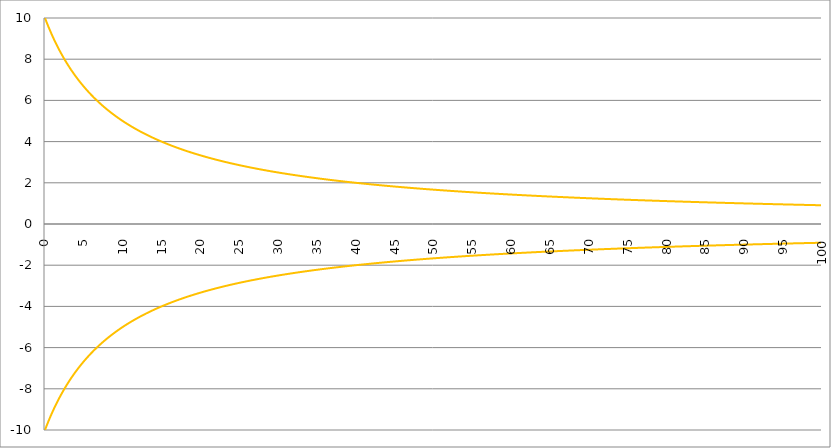
| Category | Series 1 | Series 0 | Series 2 |
|---|---|---|---|
| 0.0 | 10 | -10 |  |
| 0.05 | 9.95 | -9.95 |  |
| 0.1 | 9.901 | -9.901 |  |
| 0.15 | 9.852 | -9.852 |  |
| 0.2 | 9.804 | -9.804 |  |
| 0.25 | 9.756 | -9.756 |  |
| 0.3 | 9.709 | -9.709 |  |
| 0.35 | 9.662 | -9.662 |  |
| 0.4 | 9.615 | -9.615 |  |
| 0.45 | 9.569 | -9.569 |  |
| 0.5 | 9.524 | -9.524 |  |
| 0.55 | 9.479 | -9.479 |  |
| 0.6 | 9.434 | -9.434 |  |
| 0.65 | 9.39 | -9.39 |  |
| 0.7 | 9.346 | -9.346 |  |
| 0.75 | 9.302 | -9.302 |  |
| 0.8 | 9.259 | -9.259 |  |
| 0.85 | 9.217 | -9.217 |  |
| 0.9 | 9.174 | -9.174 |  |
| 0.95 | 9.132 | -9.132 |  |
| 1.0 | 9.091 | -9.091 |  |
| 1.05 | 9.05 | -9.05 |  |
| 1.1 | 9.009 | -9.009 |  |
| 1.15 | 8.969 | -8.969 |  |
| 1.2 | 8.929 | -8.929 |  |
| 1.25 | 8.889 | -8.889 |  |
| 1.3 | 8.85 | -8.85 |  |
| 1.35 | 8.811 | -8.811 |  |
| 1.400000000000001 | 8.772 | -8.772 |  |
| 1.450000000000001 | 8.734 | -8.734 |  |
| 1.500000000000001 | 8.696 | -8.696 |  |
| 1.550000000000001 | 8.658 | -8.658 |  |
| 1.600000000000001 | 8.621 | -8.621 |  |
| 1.650000000000001 | 8.584 | -8.584 |  |
| 1.700000000000001 | 8.547 | -8.547 |  |
| 1.750000000000001 | 8.511 | -8.511 |  |
| 1.800000000000001 | 8.475 | -8.475 |  |
| 1.850000000000001 | 8.439 | -8.439 |  |
| 1.900000000000001 | 8.403 | -8.403 |  |
| 1.950000000000001 | 8.368 | -8.368 |  |
| 2.000000000000001 | 8.333 | -8.333 |  |
| 2.050000000000001 | 8.299 | -8.299 |  |
| 2.100000000000001 | 8.264 | -8.264 |  |
| 2.15 | 8.23 | -8.23 |  |
| 2.2 | 8.197 | -8.197 |  |
| 2.25 | 8.163 | -8.163 |  |
| 2.3 | 8.13 | -8.13 |  |
| 2.35 | 8.097 | -8.097 |  |
| 2.399999999999999 | 8.065 | -8.065 |  |
| 2.449999999999999 | 8.032 | -8.032 |  |
| 2.499999999999999 | 8 | -8 |  |
| 2.549999999999999 | 7.968 | -7.968 |  |
| 2.599999999999999 | 7.937 | -7.937 |  |
| 2.649999999999998 | 7.905 | -7.905 |  |
| 2.699999999999998 | 7.874 | -7.874 |  |
| 2.749999999999998 | 7.843 | -7.843 |  |
| 2.799999999999998 | 7.813 | -7.813 |  |
| 2.849999999999998 | 7.782 | -7.782 |  |
| 2.899999999999998 | 7.752 | -7.752 |  |
| 2.949999999999997 | 7.722 | -7.722 |  |
| 2.999999999999997 | 7.692 | -7.692 |  |
| 3.049999999999997 | 7.663 | -7.663 |  |
| 3.099999999999997 | 7.634 | -7.634 |  |
| 3.149999999999997 | 7.605 | -7.605 |  |
| 3.199999999999997 | 7.576 | -7.576 |  |
| 3.249999999999996 | 7.547 | -7.547 |  |
| 3.299999999999996 | 7.519 | -7.519 |  |
| 3.349999999999996 | 7.491 | -7.491 |  |
| 3.399999999999996 | 7.463 | -7.463 |  |
| 3.449999999999996 | 7.435 | -7.435 |  |
| 3.499999999999996 | 7.407 | -7.407 |  |
| 3.549999999999995 | 7.38 | -7.38 |  |
| 3.599999999999995 | 7.353 | -7.353 |  |
| 3.649999999999995 | 7.326 | -7.326 |  |
| 3.699999999999995 | 7.299 | -7.299 |  |
| 3.749999999999995 | 7.273 | -7.273 |  |
| 3.799999999999994 | 7.246 | -7.246 |  |
| 3.849999999999994 | 7.22 | -7.22 |  |
| 3.899999999999994 | 7.194 | -7.194 |  |
| 3.949999999999994 | 7.168 | -7.168 |  |
| 3.999999999999994 | 7.143 | -7.143 |  |
| 4.049999999999994 | 7.117 | -7.117 |  |
| 4.099999999999993 | 7.092 | -7.092 |  |
| 4.149999999999993 | 7.067 | -7.067 |  |
| 4.199999999999993 | 7.042 | -7.042 |  |
| 4.249999999999993 | 7.018 | -7.018 |  |
| 4.299999999999993 | 6.993 | -6.993 |  |
| 4.349999999999992 | 6.969 | -6.969 |  |
| 4.399999999999992 | 6.944 | -6.944 |  |
| 4.449999999999992 | 6.92 | -6.92 |  |
| 4.499999999999992 | 6.897 | -6.897 |  |
| 4.549999999999992 | 6.873 | -6.873 |  |
| 4.599999999999992 | 6.849 | -6.849 |  |
| 4.649999999999991 | 6.826 | -6.826 |  |
| 4.699999999999991 | 6.803 | -6.803 |  |
| 4.749999999999991 | 6.78 | -6.78 |  |
| 4.799999999999991 | 6.757 | -6.757 |  |
| 4.849999999999991 | 6.734 | -6.734 |  |
| 4.899999999999991 | 6.711 | -6.711 |  |
| 4.94999999999999 | 6.689 | -6.689 |  |
| 4.99999999999999 | 6.667 | -6.667 |  |
| 5.04999999999999 | 6.645 | -6.645 |  |
| 5.09999999999999 | 6.623 | -6.623 |  |
| 5.14999999999999 | 6.601 | -6.601 |  |
| 5.199999999999989 | 6.579 | -6.579 |  |
| 5.24999999999999 | 6.557 | -6.557 |  |
| 5.29999999999999 | 6.536 | -6.536 |  |
| 5.349999999999989 | 6.515 | -6.515 |  |
| 5.399999999999989 | 6.494 | -6.494 |  |
| 5.449999999999988 | 6.472 | -6.472 |  |
| 5.499999999999988 | 6.452 | -6.452 |  |
| 5.549999999999988 | 6.431 | -6.431 |  |
| 5.599999999999988 | 6.41 | -6.41 |  |
| 5.649999999999988 | 6.39 | -6.39 |  |
| 5.699999999999988 | 6.369 | -6.369 |  |
| 5.749999999999987 | 6.349 | -6.349 |  |
| 5.799999999999987 | 6.329 | -6.329 |  |
| 5.849999999999987 | 6.309 | -6.309 |  |
| 5.899999999999987 | 6.289 | -6.289 |  |
| 5.949999999999986 | 6.27 | -6.27 |  |
| 5.999999999999986 | 6.25 | -6.25 |  |
| 6.049999999999986 | 6.231 | -6.231 |  |
| 6.099999999999986 | 6.211 | -6.211 |  |
| 6.149999999999986 | 6.192 | -6.192 |  |
| 6.199999999999986 | 6.173 | -6.173 |  |
| 6.249999999999985 | 6.154 | -6.154 |  |
| 6.299999999999985 | 6.135 | -6.135 |  |
| 6.349999999999985 | 6.116 | -6.116 |  |
| 6.399999999999985 | 6.098 | -6.098 |  |
| 6.449999999999985 | 6.079 | -6.079 |  |
| 6.499999999999984 | 6.061 | -6.061 |  |
| 6.549999999999984 | 6.042 | -6.042 |  |
| 6.599999999999984 | 6.024 | -6.024 |  |
| 6.649999999999984 | 6.006 | -6.006 |  |
| 6.699999999999984 | 5.988 | -5.988 |  |
| 6.749999999999984 | 5.97 | -5.97 |  |
| 6.799999999999984 | 5.952 | -5.952 |  |
| 6.849999999999984 | 5.935 | -5.935 |  |
| 6.899999999999983 | 5.917 | -5.917 |  |
| 6.949999999999983 | 5.9 | -5.9 |  |
| 6.999999999999983 | 5.882 | -5.882 |  |
| 7.049999999999983 | 5.865 | -5.865 |  |
| 7.099999999999983 | 5.848 | -5.848 |  |
| 7.149999999999983 | 5.831 | -5.831 |  |
| 7.199999999999982 | 5.814 | -5.814 |  |
| 7.249999999999982 | 5.797 | -5.797 |  |
| 7.299999999999982 | 5.78 | -5.78 |  |
| 7.349999999999982 | 5.764 | -5.764 |  |
| 7.399999999999982 | 5.747 | -5.747 |  |
| 7.449999999999981 | 5.731 | -5.731 |  |
| 7.499999999999981 | 5.714 | -5.714 |  |
| 7.549999999999981 | 5.698 | -5.698 |  |
| 7.599999999999981 | 5.682 | -5.682 |  |
| 7.649999999999981 | 5.666 | -5.666 |  |
| 7.699999999999981 | 5.65 | -5.65 |  |
| 7.74999999999998 | 5.634 | -5.634 |  |
| 7.79999999999998 | 5.618 | -5.618 |  |
| 7.84999999999998 | 5.602 | -5.602 |  |
| 7.89999999999998 | 5.587 | -5.587 |  |
| 7.94999999999998 | 5.571 | -5.571 |  |
| 7.99999999999998 | 5.556 | -5.556 |  |
| 8.04999999999998 | 5.54 | -5.54 |  |
| 8.09999999999998 | 5.525 | -5.525 |  |
| 8.14999999999998 | 5.51 | -5.51 |  |
| 8.19999999999998 | 5.495 | -5.495 |  |
| 8.249999999999982 | 5.479 | -5.479 |  |
| 8.299999999999981 | 5.464 | -5.464 |  |
| 8.349999999999984 | 5.45 | -5.45 |  |
| 8.399999999999984 | 5.435 | -5.435 |  |
| 8.449999999999985 | 5.42 | -5.42 |  |
| 8.499999999999986 | 5.405 | -5.405 |  |
| 8.549999999999986 | 5.391 | -5.391 |  |
| 8.599999999999987 | 5.376 | -5.376 |  |
| 8.649999999999986 | 5.362 | -5.362 |  |
| 8.699999999999989 | 5.348 | -5.348 |  |
| 8.74999999999999 | 5.333 | -5.333 |  |
| 8.79999999999999 | 5.319 | -5.319 |  |
| 8.84999999999999 | 5.305 | -5.305 |  |
| 8.89999999999999 | 5.291 | -5.291 |  |
| 8.94999999999999 | 5.277 | -5.277 |  |
| 8.99999999999999 | 5.263 | -5.263 |  |
| 9.049999999999994 | 5.249 | -5.249 |  |
| 9.099999999999994 | 5.236 | -5.236 |  |
| 9.149999999999995 | 5.222 | -5.222 |  |
| 9.199999999999996 | 5.208 | -5.208 |  |
| 9.249999999999996 | 5.195 | -5.195 |  |
| 9.299999999999997 | 5.181 | -5.181 |  |
| 9.349999999999998 | 5.168 | -5.168 |  |
| 9.399999999999999 | 5.155 | -5.155 |  |
| 9.45 | 5.141 | -5.141 |  |
| 9.5 | 5.128 | -5.128 |  |
| 9.55 | 5.115 | -5.115 |  |
| 9.600000000000001 | 5.102 | -5.102 |  |
| 9.650000000000002 | 5.089 | -5.089 |  |
| 9.700000000000003 | 5.076 | -5.076 |  |
| 9.750000000000004 | 5.063 | -5.063 |  |
| 9.800000000000004 | 5.051 | -5.051 |  |
| 9.850000000000003 | 5.038 | -5.038 |  |
| 9.900000000000006 | 5.025 | -5.025 |  |
| 9.950000000000006 | 5.013 | -5.013 |  |
| 10.00000000000001 | 5 | -5 |  |
| 10.05000000000001 | 4.988 | -4.988 |  |
| 10.10000000000001 | 4.975 | -4.975 |  |
| 10.15000000000001 | 4.963 | -4.963 |  |
| 10.20000000000001 | 4.95 | -4.95 |  |
| 10.25000000000001 | 4.938 | -4.938 |  |
| 10.30000000000001 | 4.926 | -4.926 |  |
| 10.35000000000001 | 4.914 | -4.914 |  |
| 10.40000000000001 | 4.902 | -4.902 |  |
| 10.45000000000001 | 4.89 | -4.89 |  |
| 10.50000000000001 | 4.878 | -4.878 |  |
| 10.55000000000001 | 4.866 | -4.866 |  |
| 10.60000000000002 | 4.854 | -4.854 |  |
| 10.65000000000002 | 4.843 | -4.843 |  |
| 10.70000000000002 | 4.831 | -4.831 |  |
| 10.75000000000002 | 4.819 | -4.819 |  |
| 10.80000000000002 | 4.808 | -4.808 |  |
| 10.85000000000002 | 4.796 | -4.796 |  |
| 10.90000000000002 | 4.785 | -4.785 |  |
| 10.95000000000002 | 4.773 | -4.773 |  |
| 11.00000000000002 | 4.762 | -4.762 |  |
| 11.05000000000002 | 4.751 | -4.751 |  |
| 11.10000000000002 | 4.739 | -4.739 |  |
| 11.15000000000002 | 4.728 | -4.728 |  |
| 11.20000000000002 | 4.717 | -4.717 |  |
| 11.25000000000002 | 4.706 | -4.706 |  |
| 11.30000000000003 | 4.695 | -4.695 |  |
| 11.35000000000003 | 4.684 | -4.684 |  |
| 11.40000000000003 | 4.673 | -4.673 |  |
| 11.45000000000003 | 4.662 | -4.662 |  |
| 11.50000000000003 | 4.651 | -4.651 |  |
| 11.55000000000003 | 4.64 | -4.64 |  |
| 11.60000000000003 | 4.63 | -4.63 |  |
| 11.65000000000003 | 4.619 | -4.619 |  |
| 11.70000000000003 | 4.608 | -4.608 |  |
| 11.75000000000003 | 4.598 | -4.598 |  |
| 11.80000000000003 | 4.587 | -4.587 |  |
| 11.85000000000003 | 4.577 | -4.577 |  |
| 11.90000000000003 | 4.566 | -4.566 |  |
| 11.95000000000003 | 4.556 | -4.556 |  |
| 12.00000000000004 | 4.545 | -4.545 |  |
| 12.05000000000004 | 4.535 | -4.535 |  |
| 12.10000000000004 | 4.525 | -4.525 |  |
| 12.15000000000004 | 4.515 | -4.515 |  |
| 12.20000000000004 | 4.505 | -4.505 |  |
| 12.25000000000004 | 4.494 | -4.494 |  |
| 12.30000000000004 | 4.484 | -4.484 |  |
| 12.35000000000004 | 4.474 | -4.474 |  |
| 12.40000000000004 | 4.464 | -4.464 |  |
| 12.45000000000004 | 4.454 | -4.454 |  |
| 12.50000000000004 | 4.444 | -4.444 |  |
| 12.55000000000004 | 4.435 | -4.435 |  |
| 12.60000000000004 | 4.425 | -4.425 |  |
| 12.65000000000004 | 4.415 | -4.415 |  |
| 12.70000000000005 | 4.405 | -4.405 |  |
| 12.75000000000005 | 4.396 | -4.396 |  |
| 12.80000000000005 | 4.386 | -4.386 |  |
| 12.85000000000005 | 4.376 | -4.376 |  |
| 12.90000000000005 | 4.367 | -4.367 |  |
| 12.95000000000005 | 4.357 | -4.357 |  |
| 13.00000000000005 | 4.348 | -4.348 |  |
| 13.05000000000005 | 4.338 | -4.338 |  |
| 13.10000000000005 | 4.329 | -4.329 |  |
| 13.15000000000005 | 4.32 | -4.32 |  |
| 13.20000000000005 | 4.31 | -4.31 |  |
| 13.25000000000005 | 4.301 | -4.301 |  |
| 13.30000000000005 | 4.292 | -4.292 |  |
| 13.35000000000005 | 4.283 | -4.283 |  |
| 13.40000000000006 | 4.274 | -4.274 |  |
| 13.45000000000006 | 4.264 | -4.264 |  |
| 13.50000000000006 | 4.255 | -4.255 |  |
| 13.55000000000006 | 4.246 | -4.246 |  |
| 13.60000000000006 | 4.237 | -4.237 |  |
| 13.65000000000006 | 4.228 | -4.228 |  |
| 13.70000000000006 | 4.219 | -4.219 |  |
| 13.75000000000006 | 4.211 | -4.211 |  |
| 13.80000000000006 | 4.202 | -4.202 |  |
| 13.85000000000006 | 4.193 | -4.193 |  |
| 13.90000000000006 | 4.184 | -4.184 |  |
| 13.95000000000006 | 4.175 | -4.175 |  |
| 14.00000000000006 | 4.167 | -4.167 |  |
| 14.05000000000006 | 4.158 | -4.158 |  |
| 14.10000000000007 | 4.149 | -4.149 |  |
| 14.15000000000007 | 4.141 | -4.141 |  |
| 14.20000000000007 | 4.132 | -4.132 |  |
| 14.25000000000007 | 4.124 | -4.124 |  |
| 14.30000000000007 | 4.115 | -4.115 |  |
| 14.35000000000007 | 4.107 | -4.107 |  |
| 14.40000000000007 | 4.098 | -4.098 |  |
| 14.45000000000007 | 4.09 | -4.09 |  |
| 14.50000000000007 | 4.082 | -4.082 |  |
| 14.55000000000007 | 4.073 | -4.073 |  |
| 14.60000000000007 | 4.065 | -4.065 |  |
| 14.65000000000007 | 4.057 | -4.057 |  |
| 14.70000000000007 | 4.049 | -4.049 |  |
| 14.75000000000007 | 4.04 | -4.04 |  |
| 14.80000000000008 | 4.032 | -4.032 |  |
| 14.85000000000008 | 4.024 | -4.024 |  |
| 14.90000000000008 | 4.016 | -4.016 |  |
| 14.95000000000008 | 4.008 | -4.008 |  |
| 15.00000000000008 | 4 | -4 |  |
| 15.05000000000008 | 3.992 | -3.992 |  |
| 15.10000000000008 | 3.984 | -3.984 |  |
| 15.15000000000008 | 3.976 | -3.976 |  |
| 15.20000000000008 | 3.968 | -3.968 |  |
| 15.25000000000008 | 3.96 | -3.96 |  |
| 15.30000000000008 | 3.953 | -3.953 |  |
| 15.35000000000008 | 3.945 | -3.945 |  |
| 15.40000000000008 | 3.937 | -3.937 |  |
| 15.45000000000008 | 3.929 | -3.929 |  |
| 15.50000000000009 | 3.922 | -3.922 |  |
| 15.55000000000009 | 3.914 | -3.914 |  |
| 15.60000000000009 | 3.906 | -3.906 |  |
| 15.65000000000009 | 3.899 | -3.899 |  |
| 15.70000000000009 | 3.891 | -3.891 |  |
| 15.75000000000009 | 3.883 | -3.883 |  |
| 15.80000000000009 | 3.876 | -3.876 |  |
| 15.8500000000001 | 3.868 | -3.868 |  |
| 15.9000000000001 | 3.861 | -3.861 |  |
| 15.9500000000001 | 3.854 | -3.854 |  |
| 16.00000000000009 | 3.846 | -3.846 |  |
| 16.05000000000009 | 3.839 | -3.839 |  |
| 16.10000000000009 | 3.831 | -3.831 |  |
| 16.15000000000009 | 3.824 | -3.824 |  |
| 16.2000000000001 | 3.817 | -3.817 |  |
| 16.2500000000001 | 3.81 | -3.81 |  |
| 16.3000000000001 | 3.802 | -3.802 |  |
| 16.3500000000001 | 3.795 | -3.795 |  |
| 16.4000000000001 | 3.788 | -3.788 |  |
| 16.4500000000001 | 3.781 | -3.781 |  |
| 16.5000000000001 | 3.774 | -3.774 |  |
| 16.5500000000001 | 3.766 | -3.766 |  |
| 16.6000000000001 | 3.759 | -3.759 |  |
| 16.6500000000001 | 3.752 | -3.752 |  |
| 16.7000000000001 | 3.745 | -3.745 |  |
| 16.7500000000001 | 3.738 | -3.738 |  |
| 16.8000000000001 | 3.731 | -3.731 |  |
| 16.8500000000001 | 3.724 | -3.724 |  |
| 16.90000000000011 | 3.717 | -3.717 |  |
| 16.95000000000011 | 3.711 | -3.711 |  |
| 17.00000000000011 | 3.704 | -3.704 |  |
| 17.05000000000011 | 3.697 | -3.697 |  |
| 17.10000000000011 | 3.69 | -3.69 |  |
| 17.15000000000011 | 3.683 | -3.683 |  |
| 17.20000000000011 | 3.676 | -3.676 |  |
| 17.25000000000011 | 3.67 | -3.67 |  |
| 17.30000000000011 | 3.663 | -3.663 |  |
| 17.35000000000011 | 3.656 | -3.656 |  |
| 17.40000000000011 | 3.65 | -3.65 |  |
| 17.45000000000011 | 3.643 | -3.643 |  |
| 17.50000000000011 | 3.636 | -3.636 |  |
| 17.55000000000011 | 3.63 | -3.63 |  |
| 17.60000000000012 | 3.623 | -3.623 |  |
| 17.65000000000012 | 3.617 | -3.617 |  |
| 17.70000000000012 | 3.61 | -3.61 |  |
| 17.75000000000012 | 3.604 | -3.604 |  |
| 17.80000000000012 | 3.597 | -3.597 |  |
| 17.85000000000012 | 3.591 | -3.591 |  |
| 17.90000000000012 | 3.584 | -3.584 |  |
| 17.95000000000012 | 3.578 | -3.578 |  |
| 18.00000000000012 | 3.571 | -3.571 |  |
| 18.05000000000012 | 3.565 | -3.565 |  |
| 18.10000000000012 | 3.559 | -3.559 |  |
| 18.15000000000012 | 3.552 | -3.552 |  |
| 18.20000000000012 | 3.546 | -3.546 |  |
| 18.25000000000012 | 3.54 | -3.54 |  |
| 18.30000000000013 | 3.534 | -3.534 |  |
| 18.35000000000013 | 3.527 | -3.527 |  |
| 18.40000000000013 | 3.521 | -3.521 |  |
| 18.45000000000013 | 3.515 | -3.515 |  |
| 18.50000000000013 | 3.509 | -3.509 |  |
| 18.55000000000013 | 3.503 | -3.503 |  |
| 18.60000000000013 | 3.497 | -3.497 |  |
| 18.65000000000013 | 3.49 | -3.49 |  |
| 18.70000000000013 | 3.484 | -3.484 |  |
| 18.75000000000013 | 3.478 | -3.478 |  |
| 18.80000000000013 | 3.472 | -3.472 |  |
| 18.85000000000013 | 3.466 | -3.466 |  |
| 18.90000000000013 | 3.46 | -3.46 |  |
| 18.95000000000013 | 3.454 | -3.454 |  |
| 19.00000000000014 | 3.448 | -3.448 |  |
| 19.05000000000014 | 3.442 | -3.442 |  |
| 19.10000000000014 | 3.436 | -3.436 |  |
| 19.15000000000014 | 3.431 | -3.431 |  |
| 19.20000000000014 | 3.425 | -3.425 |  |
| 19.25000000000014 | 3.419 | -3.419 |  |
| 19.30000000000014 | 3.413 | -3.413 |  |
| 19.35000000000014 | 3.407 | -3.407 |  |
| 19.40000000000014 | 3.401 | -3.401 |  |
| 19.45000000000014 | 3.396 | -3.396 |  |
| 19.50000000000014 | 3.39 | -3.39 |  |
| 19.55000000000014 | 3.384 | -3.384 |  |
| 19.60000000000014 | 3.378 | -3.378 |  |
| 19.65000000000014 | 3.373 | -3.373 |  |
| 19.70000000000014 | 3.367 | -3.367 |  |
| 19.75000000000015 | 3.361 | -3.361 |  |
| 19.80000000000015 | 3.356 | -3.356 |  |
| 19.85000000000015 | 3.35 | -3.35 |  |
| 19.90000000000015 | 3.344 | -3.344 |  |
| 19.95000000000015 | 3.339 | -3.339 |  |
| 20.00000000000015 | 3.333 | -3.333 |  |
| 20.05000000000015 | 3.328 | -3.328 |  |
| 20.10000000000015 | 3.322 | -3.322 |  |
| 20.15000000000015 | 3.317 | -3.317 |  |
| 20.20000000000015 | 3.311 | -3.311 |  |
| 20.25000000000015 | 3.306 | -3.306 |  |
| 20.30000000000015 | 3.3 | -3.3 |  |
| 20.35000000000015 | 3.295 | -3.295 |  |
| 20.40000000000015 | 3.289 | -3.289 |  |
| 20.45000000000016 | 3.284 | -3.284 |  |
| 20.50000000000016 | 3.279 | -3.279 |  |
| 20.55000000000016 | 3.273 | -3.273 |  |
| 20.60000000000016 | 3.268 | -3.268 |  |
| 20.65000000000016 | 3.263 | -3.263 |  |
| 20.70000000000016 | 3.257 | -3.257 |  |
| 20.75000000000016 | 3.252 | -3.252 |  |
| 20.80000000000016 | 3.247 | -3.247 |  |
| 20.85000000000016 | 3.241 | -3.241 |  |
| 20.90000000000016 | 3.236 | -3.236 |  |
| 20.95000000000016 | 3.231 | -3.231 |  |
| 21.00000000000016 | 3.226 | -3.226 |  |
| 21.05000000000016 | 3.221 | -3.221 |  |
| 21.10000000000016 | 3.215 | -3.215 |  |
| 21.15000000000017 | 3.21 | -3.21 |  |
| 21.20000000000017 | 3.205 | -3.205 |  |
| 21.25000000000017 | 3.2 | -3.2 |  |
| 21.30000000000017 | 3.195 | -3.195 |  |
| 21.35000000000017 | 3.19 | -3.19 |  |
| 21.40000000000017 | 3.185 | -3.185 |  |
| 21.45000000000017 | 3.18 | -3.18 |  |
| 21.50000000000017 | 3.175 | -3.175 |  |
| 21.55000000000017 | 3.17 | -3.17 |  |
| 21.60000000000017 | 3.165 | -3.165 |  |
| 21.65000000000017 | 3.16 | -3.16 |  |
| 21.70000000000017 | 3.155 | -3.155 |  |
| 21.75000000000017 | 3.15 | -3.15 |  |
| 21.80000000000017 | 3.145 | -3.145 |  |
| 21.85000000000018 | 3.14 | -3.14 |  |
| 21.90000000000018 | 3.135 | -3.135 |  |
| 21.95000000000018 | 3.13 | -3.13 |  |
| 22.00000000000018 | 3.125 | -3.125 |  |
| 22.05000000000018 | 3.12 | -3.12 |  |
| 22.10000000000018 | 3.115 | -3.115 |  |
| 22.15000000000018 | 3.11 | -3.11 |  |
| 22.20000000000018 | 3.106 | -3.106 |  |
| 22.25000000000018 | 3.101 | -3.101 |  |
| 22.30000000000018 | 3.096 | -3.096 |  |
| 22.35000000000018 | 3.091 | -3.091 |  |
| 22.40000000000018 | 3.086 | -3.086 |  |
| 22.45000000000018 | 3.082 | -3.082 |  |
| 22.50000000000018 | 3.077 | -3.077 |  |
| 22.55000000000019 | 3.072 | -3.072 |  |
| 22.60000000000019 | 3.067 | -3.067 |  |
| 22.65000000000019 | 3.063 | -3.063 |  |
| 22.70000000000019 | 3.058 | -3.058 |  |
| 22.75000000000019 | 3.053 | -3.053 |  |
| 22.80000000000019 | 3.049 | -3.049 |  |
| 22.85000000000019 | 3.044 | -3.044 |  |
| 22.90000000000019 | 3.04 | -3.04 |  |
| 22.95000000000019 | 3.035 | -3.035 |  |
| 23.00000000000019 | 3.03 | -3.03 |  |
| 23.05000000000019 | 3.026 | -3.026 |  |
| 23.10000000000019 | 3.021 | -3.021 |  |
| 23.15000000000019 | 3.017 | -3.017 |  |
| 23.20000000000019 | 3.012 | -3.012 |  |
| 23.2500000000002 | 3.008 | -3.008 |  |
| 23.3000000000002 | 3.003 | -3.003 |  |
| 23.3500000000002 | 2.999 | -2.999 |  |
| 23.4000000000002 | 2.994 | -2.994 |  |
| 23.4500000000002 | 2.99 | -2.99 |  |
| 23.5000000000002 | 2.985 | -2.985 |  |
| 23.5500000000002 | 2.981 | -2.981 |  |
| 23.6000000000002 | 2.976 | -2.976 |  |
| 23.6500000000002 | 2.972 | -2.972 |  |
| 23.7000000000002 | 2.967 | -2.967 |  |
| 23.7500000000002 | 2.963 | -2.963 |  |
| 23.8000000000002 | 2.959 | -2.959 |  |
| 23.8500000000002 | 2.954 | -2.954 |  |
| 23.9000000000002 | 2.95 | -2.95 |  |
| 23.95000000000021 | 2.946 | -2.946 |  |
| 24.00000000000021 | 2.941 | -2.941 |  |
| 24.05000000000021 | 2.937 | -2.937 |  |
| 24.10000000000021 | 2.933 | -2.933 |  |
| 24.15000000000021 | 2.928 | -2.928 |  |
| 24.20000000000021 | 2.924 | -2.924 |  |
| 24.25000000000021 | 2.92 | -2.92 |  |
| 24.30000000000021 | 2.915 | -2.915 |  |
| 24.35000000000021 | 2.911 | -2.911 |  |
| 24.40000000000021 | 2.907 | -2.907 |  |
| 24.45000000000021 | 2.903 | -2.903 |  |
| 24.50000000000021 | 2.899 | -2.899 |  |
| 24.55000000000021 | 2.894 | -2.894 |  |
| 24.60000000000021 | 2.89 | -2.89 |  |
| 24.65000000000022 | 2.886 | -2.886 |  |
| 24.70000000000022 | 2.882 | -2.882 |  |
| 24.75000000000022 | 2.878 | -2.878 |  |
| 24.80000000000022 | 2.874 | -2.874 |  |
| 24.85000000000022 | 2.869 | -2.869 |  |
| 24.90000000000022 | 2.865 | -2.865 |  |
| 24.95000000000022 | 2.861 | -2.861 |  |
| 25.00000000000022 | 2.857 | -2.857 |  |
| 25.05000000000022 | 2.853 | -2.853 |  |
| 25.10000000000022 | 2.849 | -2.849 |  |
| 25.15000000000022 | 2.845 | -2.845 |  |
| 25.20000000000022 | 2.841 | -2.841 |  |
| 25.25000000000022 | 2.837 | -2.837 |  |
| 25.30000000000022 | 2.833 | -2.833 |  |
| 25.35000000000023 | 2.829 | -2.829 |  |
| 25.40000000000023 | 2.825 | -2.825 |  |
| 25.45000000000023 | 2.821 | -2.821 |  |
| 25.50000000000023 | 2.817 | -2.817 |  |
| 25.55000000000023 | 2.813 | -2.813 |  |
| 25.60000000000023 | 2.809 | -2.809 |  |
| 25.65000000000023 | 2.805 | -2.805 |  |
| 25.70000000000023 | 2.801 | -2.801 |  |
| 25.75000000000023 | 2.797 | -2.797 |  |
| 25.80000000000023 | 2.793 | -2.793 |  |
| 25.85000000000023 | 2.789 | -2.789 |  |
| 25.90000000000023 | 2.786 | -2.786 |  |
| 25.95000000000023 | 2.782 | -2.782 |  |
| 26.00000000000023 | 2.778 | -2.778 |  |
| 26.05000000000024 | 2.774 | -2.774 |  |
| 26.10000000000024 | 2.77 | -2.77 |  |
| 26.15000000000024 | 2.766 | -2.766 |  |
| 26.20000000000024 | 2.762 | -2.762 |  |
| 26.25000000000024 | 2.759 | -2.759 |  |
| 26.30000000000024 | 2.755 | -2.755 |  |
| 26.35000000000024 | 2.751 | -2.751 |  |
| 26.40000000000024 | 2.747 | -2.747 |  |
| 26.45000000000024 | 2.743 | -2.743 |  |
| 26.50000000000024 | 2.74 | -2.74 |  |
| 26.55000000000024 | 2.736 | -2.736 |  |
| 26.60000000000024 | 2.732 | -2.732 |  |
| 26.65000000000024 | 2.729 | -2.729 |  |
| 26.70000000000024 | 2.725 | -2.725 |  |
| 26.75000000000025 | 2.721 | -2.721 |  |
| 26.80000000000025 | 2.717 | -2.717 |  |
| 26.85000000000025 | 2.714 | -2.714 |  |
| 26.90000000000025 | 2.71 | -2.71 |  |
| 26.95000000000025 | 2.706 | -2.706 |  |
| 27.00000000000025 | 2.703 | -2.703 |  |
| 27.05000000000025 | 2.699 | -2.699 |  |
| 27.10000000000025 | 2.695 | -2.695 |  |
| 27.15000000000025 | 2.692 | -2.692 |  |
| 27.20000000000025 | 2.688 | -2.688 |  |
| 27.25000000000025 | 2.685 | -2.685 |  |
| 27.30000000000025 | 2.681 | -2.681 |  |
| 27.35000000000025 | 2.677 | -2.677 |  |
| 27.40000000000025 | 2.674 | -2.674 |  |
| 27.45000000000026 | 2.67 | -2.67 |  |
| 27.50000000000026 | 2.667 | -2.667 |  |
| 27.55000000000026 | 2.663 | -2.663 |  |
| 27.60000000000026 | 2.66 | -2.66 |  |
| 27.65000000000026 | 2.656 | -2.656 |  |
| 27.70000000000026 | 2.653 | -2.653 |  |
| 27.75000000000026 | 2.649 | -2.649 |  |
| 27.80000000000026 | 2.646 | -2.646 |  |
| 27.85000000000026 | 2.642 | -2.642 |  |
| 27.90000000000026 | 2.639 | -2.639 |  |
| 27.95000000000026 | 2.635 | -2.635 |  |
| 28.00000000000026 | 2.632 | -2.632 |  |
| 28.05000000000026 | 2.628 | -2.628 |  |
| 28.10000000000026 | 2.625 | -2.625 |  |
| 28.15000000000027 | 2.621 | -2.621 |  |
| 28.20000000000027 | 2.618 | -2.618 |  |
| 28.25000000000027 | 2.614 | -2.614 |  |
| 28.30000000000027 | 2.611 | -2.611 |  |
| 28.35000000000027 | 2.608 | -2.608 |  |
| 28.40000000000027 | 2.604 | -2.604 |  |
| 28.45000000000027 | 2.601 | -2.601 |  |
| 28.50000000000027 | 2.597 | -2.597 |  |
| 28.55000000000027 | 2.594 | -2.594 |  |
| 28.60000000000027 | 2.591 | -2.591 |  |
| 28.65000000000027 | 2.587 | -2.587 |  |
| 28.70000000000027 | 2.584 | -2.584 |  |
| 28.75000000000027 | 2.581 | -2.581 |  |
| 28.80000000000027 | 2.577 | -2.577 |  |
| 28.85000000000027 | 2.574 | -2.574 |  |
| 28.90000000000028 | 2.571 | -2.571 |  |
| 28.95000000000028 | 2.567 | -2.567 |  |
| 29.00000000000028 | 2.564 | -2.564 |  |
| 29.05000000000028 | 2.561 | -2.561 |  |
| 29.10000000000028 | 2.558 | -2.558 |  |
| 29.15000000000028 | 2.554 | -2.554 |  |
| 29.20000000000028 | 2.551 | -2.551 |  |
| 29.25000000000028 | 2.548 | -2.548 |  |
| 29.30000000000028 | 2.545 | -2.545 |  |
| 29.35000000000028 | 2.541 | -2.541 |  |
| 29.40000000000028 | 2.538 | -2.538 |  |
| 29.45000000000028 | 2.535 | -2.535 |  |
| 29.50000000000028 | 2.532 | -2.532 |  |
| 29.55000000000028 | 2.528 | -2.528 |  |
| 29.60000000000029 | 2.525 | -2.525 |  |
| 29.65000000000029 | 2.522 | -2.522 |  |
| 29.70000000000029 | 2.519 | -2.519 |  |
| 29.75000000000029 | 2.516 | -2.516 |  |
| 29.80000000000029 | 2.513 | -2.513 |  |
| 29.85000000000029 | 2.509 | -2.509 |  |
| 29.90000000000029 | 2.506 | -2.506 |  |
| 29.95000000000029 | 2.503 | -2.503 |  |
| 30.00000000000029 | 2.5 | -2.5 |  |
| 30.05000000000029 | 2.497 | -2.497 |  |
| 30.10000000000029 | 2.494 | -2.494 |  |
| 30.15000000000029 | 2.491 | -2.491 |  |
| 30.20000000000029 | 2.488 | -2.488 |  |
| 30.25000000000029 | 2.484 | -2.484 |  |
| 30.3000000000003 | 2.481 | -2.481 |  |
| 30.3500000000003 | 2.478 | -2.478 |  |
| 30.4000000000003 | 2.475 | -2.475 |  |
| 30.4500000000003 | 2.472 | -2.472 |  |
| 30.5000000000003 | 2.469 | -2.469 |  |
| 30.5500000000003 | 2.466 | -2.466 |  |
| 30.6000000000003 | 2.463 | -2.463 |  |
| 30.6500000000003 | 2.46 | -2.46 |  |
| 30.7000000000003 | 2.457 | -2.457 |  |
| 30.7500000000003 | 2.454 | -2.454 |  |
| 30.8000000000003 | 2.451 | -2.451 |  |
| 30.8500000000003 | 2.448 | -2.448 |  |
| 30.9000000000003 | 2.445 | -2.445 |  |
| 30.9500000000003 | 2.442 | -2.442 |  |
| 31.00000000000031 | 2.439 | -2.439 |  |
| 31.05000000000031 | 2.436 | -2.436 |  |
| 31.10000000000031 | 2.433 | -2.433 |  |
| 31.15000000000031 | 2.43 | -2.43 |  |
| 31.20000000000031 | 2.427 | -2.427 |  |
| 31.25000000000031 | 2.424 | -2.424 |  |
| 31.30000000000031 | 2.421 | -2.421 |  |
| 31.35000000000031 | 2.418 | -2.418 |  |
| 31.40000000000031 | 2.415 | -2.415 |  |
| 31.45000000000031 | 2.413 | -2.413 |  |
| 31.50000000000031 | 2.41 | -2.41 |  |
| 31.55000000000031 | 2.407 | -2.407 |  |
| 31.60000000000031 | 2.404 | -2.404 |  |
| 31.65000000000031 | 2.401 | -2.401 |  |
| 31.70000000000032 | 2.398 | -2.398 |  |
| 31.75000000000032 | 2.395 | -2.395 |  |
| 31.80000000000032 | 2.392 | -2.392 |  |
| 31.85000000000032 | 2.389 | -2.389 |  |
| 31.90000000000032 | 2.387 | -2.387 |  |
| 31.95000000000032 | 2.384 | -2.384 |  |
| 32.00000000000032 | 2.381 | -2.381 |  |
| 32.05000000000032 | 2.378 | -2.378 |  |
| 32.10000000000031 | 2.375 | -2.375 |  |
| 32.15000000000031 | 2.372 | -2.372 |  |
| 32.20000000000031 | 2.37 | -2.37 |  |
| 32.25000000000031 | 2.367 | -2.367 |  |
| 32.3000000000003 | 2.364 | -2.364 |  |
| 32.3500000000003 | 2.361 | -2.361 |  |
| 32.4000000000003 | 2.358 | -2.358 |  |
| 32.45000000000029 | 2.356 | -2.356 |  |
| 32.5000000000003 | 2.353 | -2.353 |  |
| 32.55000000000029 | 2.35 | -2.35 |  |
| 32.60000000000029 | 2.347 | -2.347 |  |
| 32.65000000000028 | 2.345 | -2.345 |  |
| 32.70000000000028 | 2.342 | -2.342 |  |
| 32.75000000000028 | 2.339 | -2.339 |  |
| 32.80000000000027 | 2.336 | -2.336 |  |
| 32.85000000000027 | 2.334 | -2.334 |  |
| 32.90000000000027 | 2.331 | -2.331 |  |
| 32.95000000000027 | 2.328 | -2.328 |  |
| 33.00000000000026 | 2.326 | -2.326 |  |
| 33.05000000000026 | 2.323 | -2.323 |  |
| 33.10000000000026 | 2.32 | -2.32 |  |
| 33.15000000000025 | 2.317 | -2.317 |  |
| 33.20000000000025 | 2.315 | -2.315 |  |
| 33.25000000000025 | 2.312 | -2.312 |  |
| 33.30000000000025 | 2.309 | -2.309 |  |
| 33.35000000000024 | 2.307 | -2.307 |  |
| 33.40000000000024 | 2.304 | -2.304 |  |
| 33.45000000000024 | 2.301 | -2.301 |  |
| 33.50000000000023 | 2.299 | -2.299 |  |
| 33.55000000000023 | 2.296 | -2.296 |  |
| 33.60000000000023 | 2.294 | -2.294 |  |
| 33.65000000000023 | 2.291 | -2.291 |  |
| 33.70000000000022 | 2.288 | -2.288 |  |
| 33.75000000000022 | 2.286 | -2.286 |  |
| 33.80000000000022 | 2.283 | -2.283 |  |
| 33.85000000000021 | 2.281 | -2.281 |  |
| 33.90000000000021 | 2.278 | -2.278 |  |
| 33.95000000000021 | 2.275 | -2.275 |  |
| 34.00000000000021 | 2.273 | -2.273 |  |
| 34.0500000000002 | 2.27 | -2.27 |  |
| 34.1000000000002 | 2.268 | -2.268 |  |
| 34.1500000000002 | 2.265 | -2.265 |  |
| 34.2000000000002 | 2.262 | -2.262 |  |
| 34.2500000000002 | 2.26 | -2.26 |  |
| 34.30000000000019 | 2.257 | -2.257 |  |
| 34.35000000000019 | 2.255 | -2.255 |  |
| 34.40000000000018 | 2.252 | -2.252 |  |
| 34.45000000000018 | 2.25 | -2.25 |  |
| 34.50000000000018 | 2.247 | -2.247 |  |
| 34.55000000000017 | 2.245 | -2.245 |  |
| 34.60000000000017 | 2.242 | -2.242 |  |
| 34.65000000000017 | 2.24 | -2.24 |  |
| 34.70000000000017 | 2.237 | -2.237 |  |
| 34.75000000000016 | 2.235 | -2.235 |  |
| 34.80000000000016 | 2.232 | -2.232 |  |
| 34.85000000000016 | 2.23 | -2.23 |  |
| 34.90000000000015 | 2.227 | -2.227 |  |
| 34.95000000000015 | 2.225 | -2.225 |  |
| 35.00000000000015 | 2.222 | -2.222 |  |
| 35.05000000000015 | 2.22 | -2.22 |  |
| 35.10000000000014 | 2.217 | -2.217 |  |
| 35.15000000000014 | 2.215 | -2.215 |  |
| 35.20000000000014 | 2.212 | -2.212 |  |
| 35.25000000000013 | 2.21 | -2.21 |  |
| 35.30000000000013 | 2.208 | -2.208 |  |
| 35.35000000000013 | 2.205 | -2.205 |  |
| 35.40000000000013 | 2.203 | -2.203 |  |
| 35.45000000000012 | 2.2 | -2.2 |  |
| 35.50000000000012 | 2.198 | -2.198 |  |
| 35.55000000000012 | 2.195 | -2.195 |  |
| 35.60000000000012 | 2.193 | -2.193 |  |
| 35.65000000000011 | 2.191 | -2.191 |  |
| 35.70000000000011 | 2.188 | -2.188 |  |
| 35.75000000000011 | 2.186 | -2.186 |  |
| 35.8000000000001 | 2.183 | -2.183 |  |
| 35.8500000000001 | 2.181 | -2.181 |  |
| 35.9000000000001 | 2.179 | -2.179 |  |
| 35.9500000000001 | 2.176 | -2.176 |  |
| 36.0000000000001 | 2.174 | -2.174 |  |
| 36.05000000000009 | 2.172 | -2.172 |  |
| 36.10000000000009 | 2.169 | -2.169 |  |
| 36.15000000000008 | 2.167 | -2.167 |  |
| 36.20000000000008 | 2.165 | -2.165 |  |
| 36.25000000000008 | 2.162 | -2.162 |  |
| 36.30000000000008 | 2.16 | -2.16 |  |
| 36.35000000000007 | 2.157 | -2.157 |  |
| 36.40000000000007 | 2.155 | -2.155 |  |
| 36.45000000000007 | 2.153 | -2.153 |  |
| 36.50000000000006 | 2.151 | -2.151 |  |
| 36.55000000000006 | 2.148 | -2.148 |  |
| 36.60000000000006 | 2.146 | -2.146 |  |
| 36.65000000000006 | 2.144 | -2.144 |  |
| 36.70000000000005 | 2.141 | -2.141 |  |
| 36.75000000000005 | 2.139 | -2.139 |  |
| 36.80000000000005 | 2.137 | -2.137 |  |
| 36.85000000000004 | 2.134 | -2.134 |  |
| 36.90000000000004 | 2.132 | -2.132 |  |
| 36.95000000000004 | 2.13 | -2.13 |  |
| 37.00000000000004 | 2.128 | -2.128 |  |
| 37.05000000000003 | 2.125 | -2.125 |  |
| 37.10000000000003 | 2.123 | -2.123 |  |
| 37.15000000000003 | 2.121 | -2.121 |  |
| 37.20000000000002 | 2.119 | -2.119 |  |
| 37.25000000000002 | 2.116 | -2.116 |  |
| 37.30000000000002 | 2.114 | -2.114 |  |
| 37.35000000000002 | 2.112 | -2.112 |  |
| 37.40000000000001 | 2.11 | -2.11 |  |
| 37.45000000000001 | 2.107 | -2.107 |  |
| 37.50000000000001 | 2.105 | -2.105 |  |
| 37.55 | 2.103 | -2.103 |  |
| 37.6 | 2.101 | -2.101 |  |
| 37.65 | 2.099 | -2.099 |  |
| 37.7 | 2.096 | -2.096 |  |
| 37.75 | 2.094 | -2.094 |  |
| 37.79999999999998 | 2.092 | -2.092 |  |
| 37.84999999999999 | 2.09 | -2.09 |  |
| 37.89999999999998 | 2.088 | -2.088 |  |
| 37.94999999999998 | 2.086 | -2.086 |  |
| 37.99999999999997 | 2.083 | -2.083 |  |
| 38.04999999999997 | 2.081 | -2.081 |  |
| 38.09999999999997 | 2.079 | -2.079 |  |
| 38.14999999999997 | 2.077 | -2.077 |  |
| 38.19999999999996 | 2.075 | -2.075 |  |
| 38.24999999999996 | 2.073 | -2.073 |  |
| 38.29999999999996 | 2.07 | -2.07 |  |
| 38.34999999999996 | 2.068 | -2.068 |  |
| 38.39999999999995 | 2.066 | -2.066 |  |
| 38.44999999999995 | 2.064 | -2.064 |  |
| 38.49999999999995 | 2.062 | -2.062 |  |
| 38.54999999999994 | 2.06 | -2.06 |  |
| 38.59999999999994 | 2.058 | -2.058 |  |
| 38.64999999999994 | 2.055 | -2.055 |  |
| 38.69999999999993 | 2.053 | -2.053 |  |
| 38.74999999999993 | 2.051 | -2.051 |  |
| 38.79999999999993 | 2.049 | -2.049 |  |
| 38.84999999999993 | 2.047 | -2.047 |  |
| 38.89999999999992 | 2.045 | -2.045 |  |
| 38.94999999999992 | 2.043 | -2.043 |  |
| 38.99999999999992 | 2.041 | -2.041 |  |
| 39.04999999999992 | 2.039 | -2.039 |  |
| 39.09999999999991 | 2.037 | -2.037 |  |
| 39.14999999999991 | 2.035 | -2.035 |  |
| 39.1999999999999 | 2.033 | -2.033 |  |
| 39.2499999999999 | 2.03 | -2.03 |  |
| 39.2999999999999 | 2.028 | -2.028 |  |
| 39.3499999999999 | 2.026 | -2.026 |  |
| 39.3999999999999 | 2.024 | -2.024 |  |
| 39.4499999999999 | 2.022 | -2.022 |  |
| 39.4999999999999 | 2.02 | -2.02 |  |
| 39.5499999999999 | 2.018 | -2.018 |  |
| 39.59999999999988 | 2.016 | -2.016 |  |
| 39.64999999999988 | 2.014 | -2.014 |  |
| 39.69999999999988 | 2.012 | -2.012 |  |
| 39.74999999999987 | 2.01 | -2.01 |  |
| 39.79999999999987 | 2.008 | -2.008 |  |
| 39.84999999999987 | 2.006 | -2.006 |  |
| 39.89999999999987 | 2.004 | -2.004 |  |
| 39.94999999999987 | 2.002 | -2.002 |  |
| 39.99999999999986 | 2 | -2 |  |
| 40.04999999999986 | 1.998 | -1.998 |  |
| 40.09999999999985 | 1.996 | -1.996 |  |
| 40.14999999999985 | 1.994 | -1.994 |  |
| 40.19999999999985 | 1.992 | -1.992 |  |
| 40.24999999999985 | 1.99 | -1.99 |  |
| 40.29999999999984 | 1.988 | -1.988 |  |
| 40.34999999999984 | 1.986 | -1.986 |  |
| 40.39999999999984 | 1.984 | -1.984 |  |
| 40.44999999999984 | 1.982 | -1.982 |  |
| 40.49999999999983 | 1.98 | -1.98 |  |
| 40.54999999999983 | 1.978 | -1.978 |  |
| 40.59999999999983 | 1.976 | -1.976 |  |
| 40.64999999999982 | 1.974 | -1.974 |  |
| 40.69999999999982 | 1.972 | -1.972 |  |
| 40.74999999999982 | 1.97 | -1.97 |  |
| 40.79999999999981 | 1.969 | -1.969 |  |
| 40.84999999999982 | 1.967 | -1.967 |  |
| 40.89999999999981 | 1.965 | -1.965 |  |
| 40.94999999999981 | 1.963 | -1.963 |  |
| 40.9999999999998 | 1.961 | -1.961 |  |
| 41.0499999999998 | 1.959 | -1.959 |  |
| 41.0999999999998 | 1.957 | -1.957 |  |
| 41.1499999999998 | 1.955 | -1.955 |  |
| 41.1999999999998 | 1.953 | -1.953 |  |
| 41.2499999999998 | 1.951 | -1.951 |  |
| 41.2999999999998 | 1.949 | -1.949 |  |
| 41.34999999999979 | 1.947 | -1.947 |  |
| 41.39999999999978 | 1.946 | -1.946 |  |
| 41.44999999999978 | 1.944 | -1.944 |  |
| 41.49999999999977 | 1.942 | -1.942 |  |
| 41.54999999999977 | 1.94 | -1.94 |  |
| 41.59999999999977 | 1.938 | -1.938 |  |
| 41.64999999999977 | 1.936 | -1.936 |  |
| 41.69999999999976 | 1.934 | -1.934 |  |
| 41.74999999999976 | 1.932 | -1.932 |  |
| 41.79999999999976 | 1.931 | -1.931 |  |
| 41.84999999999976 | 1.929 | -1.929 |  |
| 41.89999999999975 | 1.927 | -1.927 |  |
| 41.94999999999975 | 1.925 | -1.925 |  |
| 41.99999999999975 | 1.923 | -1.923 |  |
| 42.04999999999974 | 1.921 | -1.921 |  |
| 42.09999999999974 | 1.919 | -1.919 |  |
| 42.14999999999974 | 1.918 | -1.918 |  |
| 42.19999999999973 | 1.916 | -1.916 |  |
| 42.24999999999973 | 1.914 | -1.914 |  |
| 42.29999999999973 | 1.912 | -1.912 |  |
| 42.34999999999973 | 1.91 | -1.91 |  |
| 42.39999999999972 | 1.908 | -1.908 |  |
| 42.44999999999972 | 1.907 | -1.907 |  |
| 42.49999999999972 | 1.905 | -1.905 |  |
| 42.54999999999972 | 1.903 | -1.903 |  |
| 42.59999999999971 | 1.901 | -1.901 |  |
| 42.64999999999971 | 1.899 | -1.899 |  |
| 42.6999999999997 | 1.898 | -1.898 |  |
| 42.7499999999997 | 1.896 | -1.896 |  |
| 42.7999999999997 | 1.894 | -1.894 |  |
| 42.8499999999997 | 1.892 | -1.892 |  |
| 42.8999999999997 | 1.89 | -1.89 |  |
| 42.9499999999997 | 1.889 | -1.889 |  |
| 42.9999999999997 | 1.887 | -1.887 |  |
| 43.0499999999997 | 1.885 | -1.885 |  |
| 43.09999999999969 | 1.883 | -1.883 |  |
| 43.14999999999969 | 1.881 | -1.881 |  |
| 43.19999999999968 | 1.88 | -1.88 |  |
| 43.24999999999968 | 1.878 | -1.878 |  |
| 43.29999999999967 | 1.876 | -1.876 |  |
| 43.34999999999967 | 1.874 | -1.874 |  |
| 43.39999999999967 | 1.873 | -1.873 |  |
| 43.44999999999967 | 1.871 | -1.871 |  |
| 43.49999999999967 | 1.869 | -1.869 |  |
| 43.54999999999966 | 1.867 | -1.867 |  |
| 43.59999999999966 | 1.866 | -1.866 |  |
| 43.64999999999966 | 1.864 | -1.864 |  |
| 43.69999999999965 | 1.862 | -1.862 |  |
| 43.74999999999965 | 1.86 | -1.86 |  |
| 43.79999999999964 | 1.859 | -1.859 |  |
| 43.84999999999965 | 1.857 | -1.857 |  |
| 43.89999999999964 | 1.855 | -1.855 |  |
| 43.94999999999964 | 1.854 | -1.854 |  |
| 43.99999999999964 | 1.852 | -1.852 |  |
| 44.04999999999963 | 1.85 | -1.85 |  |
| 44.09999999999963 | 1.848 | -1.848 |  |
| 44.14999999999963 | 1.847 | -1.847 |  |
| 44.19999999999962 | 1.845 | -1.845 |  |
| 44.24999999999962 | 1.843 | -1.843 |  |
| 44.29999999999962 | 1.842 | -1.842 |  |
| 44.34999999999962 | 1.84 | -1.84 |  |
| 44.39999999999961 | 1.838 | -1.838 |  |
| 44.44999999999961 | 1.837 | -1.837 |  |
| 44.49999999999961 | 1.835 | -1.835 |  |
| 44.54999999999961 | 1.833 | -1.833 |  |
| 44.5999999999996 | 1.832 | -1.832 |  |
| 44.6499999999996 | 1.83 | -1.83 |  |
| 44.6999999999996 | 1.828 | -1.828 |  |
| 44.7499999999996 | 1.826 | -1.826 |  |
| 44.7999999999996 | 1.825 | -1.825 |  |
| 44.84999999999959 | 1.823 | -1.823 |  |
| 44.89999999999959 | 1.821 | -1.821 |  |
| 44.94999999999958 | 1.82 | -1.82 |  |
| 44.99999999999958 | 1.818 | -1.818 |  |
| 45.04999999999958 | 1.817 | -1.817 |  |
| 45.09999999999957 | 1.815 | -1.815 |  |
| 45.14999999999957 | 1.813 | -1.813 |  |
| 45.19999999999957 | 1.812 | -1.812 |  |
| 45.24999999999957 | 1.81 | -1.81 |  |
| 45.29999999999956 | 1.808 | -1.808 |  |
| 45.34999999999956 | 1.807 | -1.807 |  |
| 45.39999999999956 | 1.805 | -1.805 |  |
| 45.44999999999956 | 1.803 | -1.803 |  |
| 45.49999999999955 | 1.802 | -1.802 |  |
| 45.54999999999955 | 1.8 | -1.8 |  |
| 45.59999999999954 | 1.799 | -1.799 |  |
| 45.64999999999954 | 1.797 | -1.797 |  |
| 45.69999999999954 | 1.795 | -1.795 |  |
| 45.74999999999954 | 1.794 | -1.794 |  |
| 45.79999999999953 | 1.792 | -1.792 |  |
| 45.84999999999953 | 1.791 | -1.791 |  |
| 45.89999999999953 | 1.789 | -1.789 |  |
| 45.94999999999953 | 1.787 | -1.787 |  |
| 45.99999999999952 | 1.786 | -1.786 |  |
| 46.04999999999952 | 1.784 | -1.784 |  |
| 46.09999999999952 | 1.783 | -1.783 |  |
| 46.14999999999952 | 1.781 | -1.781 |  |
| 46.19999999999951 | 1.779 | -1.779 |  |
| 46.24999999999951 | 1.778 | -1.778 |  |
| 46.2999999999995 | 1.776 | -1.776 |  |
| 46.3499999999995 | 1.775 | -1.775 |  |
| 46.3999999999995 | 1.773 | -1.773 |  |
| 46.4499999999995 | 1.771 | -1.771 |  |
| 46.4999999999995 | 1.77 | -1.77 |  |
| 46.5499999999995 | 1.768 | -1.768 |  |
| 46.59999999999949 | 1.767 | -1.767 |  |
| 46.64999999999949 | 1.765 | -1.765 |  |
| 46.69999999999948 | 1.764 | -1.764 |  |
| 46.74999999999948 | 1.762 | -1.762 |  |
| 46.79999999999947 | 1.761 | -1.761 |  |
| 46.84999999999948 | 1.759 | -1.759 |  |
| 46.89999999999947 | 1.757 | -1.757 |  |
| 46.94999999999947 | 1.756 | -1.756 |  |
| 46.99999999999947 | 1.754 | -1.754 |  |
| 47.04999999999946 | 1.753 | -1.753 |  |
| 47.09999999999946 | 1.751 | -1.751 |  |
| 47.14999999999946 | 1.75 | -1.75 |  |
| 47.19999999999945 | 1.748 | -1.748 |  |
| 47.24999999999945 | 1.747 | -1.747 |  |
| 47.29999999999945 | 1.745 | -1.745 |  |
| 47.34999999999945 | 1.744 | -1.744 |  |
| 47.39999999999944 | 1.742 | -1.742 |  |
| 47.44999999999944 | 1.741 | -1.741 |  |
| 47.49999999999944 | 1.739 | -1.739 |  |
| 47.54999999999944 | 1.738 | -1.738 |  |
| 47.59999999999943 | 1.736 | -1.736 |  |
| 47.64999999999943 | 1.735 | -1.735 |  |
| 47.69999999999942 | 1.733 | -1.733 |  |
| 47.74999999999942 | 1.732 | -1.732 |  |
| 47.79999999999942 | 1.73 | -1.73 |  |
| 47.84999999999942 | 1.729 | -1.729 |  |
| 47.89999999999942 | 1.727 | -1.727 |  |
| 47.94999999999941 | 1.726 | -1.726 |  |
| 47.99999999999941 | 1.724 | -1.724 |  |
| 48.04999999999941 | 1.723 | -1.723 |  |
| 48.0999999999994 | 1.721 | -1.721 |  |
| 48.1499999999994 | 1.72 | -1.72 |  |
| 48.1999999999994 | 1.718 | -1.718 |  |
| 48.2499999999994 | 1.717 | -1.717 |  |
| 48.2999999999994 | 1.715 | -1.715 |  |
| 48.3499999999994 | 1.714 | -1.714 |  |
| 48.39999999999939 | 1.712 | -1.712 |  |
| 48.44999999999938 | 1.711 | -1.711 |  |
| 48.49999999999938 | 1.709 | -1.709 |  |
| 48.54999999999938 | 1.708 | -1.708 |  |
| 48.59999999999937 | 1.706 | -1.706 |  |
| 48.64999999999937 | 1.705 | -1.705 |  |
| 48.69999999999937 | 1.704 | -1.704 |  |
| 48.74999999999937 | 1.702 | -1.702 |  |
| 48.79999999999936 | 1.701 | -1.701 |  |
| 48.84999999999936 | 1.699 | -1.699 |  |
| 48.89999999999936 | 1.698 | -1.698 |  |
| 48.94999999999936 | 1.696 | -1.696 |  |
| 48.99999999999935 | 1.695 | -1.695 |  |
| 49.04999999999935 | 1.693 | -1.693 |  |
| 49.09999999999934 | 1.692 | -1.692 |  |
| 49.14999999999934 | 1.691 | -1.691 |  |
| 49.19999999999934 | 1.689 | -1.689 |  |
| 49.24999999999934 | 1.688 | -1.688 |  |
| 49.29999999999933 | 1.686 | -1.686 |  |
| 49.34999999999933 | 1.685 | -1.685 |  |
| 49.39999999999933 | 1.684 | -1.684 |  |
| 49.44999999999933 | 1.682 | -1.682 |  |
| 49.49999999999932 | 1.681 | -1.681 |  |
| 49.54999999999932 | 1.679 | -1.679 |  |
| 49.59999999999932 | 1.678 | -1.678 |  |
| 49.64999999999932 | 1.676 | -1.676 |  |
| 49.69999999999931 | 1.675 | -1.675 |  |
| 49.74999999999931 | 1.674 | -1.674 |  |
| 49.7999999999993 | 1.672 | -1.672 |  |
| 49.84999999999931 | 1.671 | -1.671 |  |
| 49.8999999999993 | 1.669 | -1.669 |  |
| 49.9499999999993 | 1.668 | -1.668 |  |
| 49.9999999999993 | 1.667 | -1.667 |  |
| 50.0499999999993 | 1.665 | -1.665 |  |
| 50.0999999999993 | 1.664 | -1.664 |  |
| 50.14999999999929 | 1.663 | -1.663 |  |
| 50.19999999999928 | 1.661 | -1.661 |  |
| 50.24999999999928 | 1.66 | -1.66 |  |
| 50.29999999999927 | 1.658 | -1.658 |  |
| 50.34999999999928 | 1.657 | -1.657 |  |
| 50.39999999999927 | 1.656 | -1.656 |  |
| 50.44999999999927 | 1.654 | -1.654 |  |
| 50.49999999999927 | 1.653 | -1.653 |  |
| 50.54999999999927 | 1.652 | -1.652 |  |
| 50.59999999999926 | 1.65 | -1.65 |  |
| 50.64999999999926 | 1.649 | -1.649 |  |
| 50.69999999999925 | 1.647 | -1.647 |  |
| 50.74999999999925 | 1.646 | -1.646 |  |
| 50.79999999999925 | 1.645 | -1.645 |  |
| 50.84999999999925 | 1.643 | -1.643 |  |
| 50.89999999999924 | 1.642 | -1.642 |  |
| 50.94999999999924 | 1.641 | -1.641 |  |
| 50.99999999999924 | 1.639 | -1.639 |  |
| 51.04999999999924 | 1.638 | -1.638 |  |
| 51.09999999999923 | 1.637 | -1.637 |  |
| 51.14999999999923 | 1.635 | -1.635 |  |
| 51.19999999999922 | 1.634 | -1.634 |  |
| 51.24999999999922 | 1.633 | -1.633 |  |
| 51.29999999999922 | 1.631 | -1.631 |  |
| 51.34999999999922 | 1.63 | -1.63 |  |
| 51.39999999999922 | 1.629 | -1.629 |  |
| 51.44999999999921 | 1.627 | -1.627 |  |
| 51.49999999999921 | 1.626 | -1.626 |  |
| 51.54999999999921 | 1.625 | -1.625 |  |
| 51.5999999999992 | 1.623 | -1.623 |  |
| 51.6499999999992 | 1.622 | -1.622 |  |
| 51.6999999999992 | 1.621 | -1.621 |  |
| 51.7499999999992 | 1.619 | -1.619 |  |
| 51.7999999999992 | 1.618 | -1.618 |  |
| 51.8499999999992 | 1.617 | -1.617 |  |
| 51.89999999999919 | 1.616 | -1.616 |  |
| 51.94999999999919 | 1.614 | -1.614 |  |
| 51.99999999999918 | 1.613 | -1.613 |  |
| 52.04999999999918 | 1.612 | -1.612 |  |
| 52.09999999999917 | 1.61 | -1.61 |  |
| 52.14999999999917 | 1.609 | -1.609 |  |
| 52.19999999999917 | 1.608 | -1.608 |  |
| 52.24999999999917 | 1.606 | -1.606 |  |
| 52.29999999999916 | 1.605 | -1.605 |  |
| 52.34999999999916 | 1.604 | -1.604 |  |
| 52.39999999999916 | 1.603 | -1.603 |  |
| 52.44999999999916 | 1.601 | -1.601 |  |
| 52.49999999999915 | 1.6 | -1.6 |  |
| 52.54999999999915 | 1.599 | -1.599 |  |
| 52.59999999999914 | 1.597 | -1.597 |  |
| 52.64999999999914 | 1.596 | -1.596 |  |
| 52.69999999999914 | 1.595 | -1.595 |  |
| 52.74999999999914 | 1.594 | -1.594 |  |
| 52.79999999999913 | 1.592 | -1.592 |  |
| 52.84999999999913 | 1.591 | -1.591 |  |
| 52.89999999999913 | 1.59 | -1.59 |  |
| 52.94999999999913 | 1.589 | -1.589 |  |
| 52.99999999999912 | 1.587 | -1.587 |  |
| 53.04999999999912 | 1.586 | -1.586 |  |
| 53.09999999999912 | 1.585 | -1.585 |  |
| 53.14999999999912 | 1.584 | -1.584 |  |
| 53.19999999999911 | 1.582 | -1.582 |  |
| 53.24999999999911 | 1.581 | -1.581 |  |
| 53.2999999999991 | 1.58 | -1.58 |  |
| 53.34999999999911 | 1.579 | -1.579 |  |
| 53.3999999999991 | 1.577 | -1.577 |  |
| 53.4499999999991 | 1.576 | -1.576 |  |
| 53.4999999999991 | 1.575 | -1.575 |  |
| 53.5499999999991 | 1.574 | -1.574 |  |
| 53.5999999999991 | 1.572 | -1.572 |  |
| 53.64999999999909 | 1.571 | -1.571 |  |
| 53.69999999999908 | 1.57 | -1.57 |  |
| 53.74999999999908 | 1.569 | -1.569 |  |
| 53.79999999999908 | 1.567 | -1.567 |  |
| 53.84999999999908 | 1.566 | -1.566 |  |
| 53.89999999999907 | 1.565 | -1.565 |  |
| 53.94999999999907 | 1.564 | -1.564 |  |
| 53.99999999999907 | 1.563 | -1.563 |  |
| 54.04999999999907 | 1.561 | -1.561 |  |
| 54.09999999999906 | 1.56 | -1.56 |  |
| 54.14999999999906 | 1.559 | -1.559 |  |
| 54.19999999999905 | 1.558 | -1.558 |  |
| 54.24999999999905 | 1.556 | -1.556 |  |
| 54.29999999999905 | 1.555 | -1.555 |  |
| 54.34999999999905 | 1.554 | -1.554 |  |
| 54.39999999999904 | 1.553 | -1.553 |  |
| 54.44999999999904 | 1.552 | -1.552 |  |
| 54.49999999999904 | 1.55 | -1.55 |  |
| 54.54999999999904 | 1.549 | -1.549 |  |
| 54.59999999999903 | 1.548 | -1.548 |  |
| 54.64999999999903 | 1.547 | -1.547 |  |
| 54.69999999999902 | 1.546 | -1.546 |  |
| 54.74999999999902 | 1.544 | -1.544 |  |
| 54.79999999999902 | 1.543 | -1.543 |  |
| 54.84999999999902 | 1.542 | -1.542 |  |
| 54.89999999999902 | 1.541 | -1.541 |  |
| 54.94999999999902 | 1.54 | -1.54 |  |
| 54.99999999999901 | 1.538 | -1.538 |  |
| 55.04999999999901 | 1.537 | -1.537 |  |
| 55.099999999999 | 1.536 | -1.536 |  |
| 55.149999999999 | 1.535 | -1.535 |  |
| 55.199999999999 | 1.534 | -1.534 |  |
| 55.249999999999 | 1.533 | -1.533 |  |
| 55.299999999999 | 1.531 | -1.531 |  |
| 55.349999999999 | 1.53 | -1.53 |  |
| 55.39999999999899 | 1.529 | -1.529 |  |
| 55.44999999999899 | 1.528 | -1.528 |  |
| 55.49999999999898 | 1.527 | -1.527 |  |
| 55.54999999999898 | 1.526 | -1.526 |  |
| 55.59999999999897 | 1.524 | -1.524 |  |
| 55.64999999999897 | 1.523 | -1.523 |  |
| 55.69999999999897 | 1.522 | -1.522 |  |
| 55.74999999999897 | 1.521 | -1.521 |  |
| 55.79999999999896 | 1.52 | -1.52 |  |
| 55.84999999999896 | 1.519 | -1.519 |  |
| 55.89999999999896 | 1.517 | -1.517 |  |
| 55.94999999999896 | 1.516 | -1.516 |  |
| 55.99999999999895 | 1.515 | -1.515 |  |
| 56.04999999999895 | 1.514 | -1.514 |  |
| 56.09999999999894 | 1.513 | -1.513 |  |
| 56.14999999999894 | 1.512 | -1.512 |  |
| 56.19999999999894 | 1.511 | -1.511 |  |
| 56.24999999999894 | 1.509 | -1.509 |  |
| 56.29999999999893 | 1.508 | -1.508 |  |
| 56.34999999999894 | 1.507 | -1.507 |  |
| 56.39999999999893 | 1.506 | -1.506 |  |
| 56.44999999999893 | 1.505 | -1.505 |  |
| 56.49999999999892 | 1.504 | -1.504 |  |
| 56.54999999999892 | 1.503 | -1.503 |  |
| 56.59999999999892 | 1.502 | -1.502 |  |
| 56.64999999999892 | 1.5 | -1.5 |  |
| 56.69999999999891 | 1.499 | -1.499 |  |
| 56.74999999999891 | 1.498 | -1.498 |  |
| 56.7999999999989 | 1.497 | -1.497 |  |
| 56.84999999999891 | 1.496 | -1.496 |  |
| 56.8999999999989 | 1.495 | -1.495 |  |
| 56.9499999999989 | 1.494 | -1.494 |  |
| 56.9999999999989 | 1.493 | -1.493 |  |
| 57.0499999999989 | 1.491 | -1.491 |  |
| 57.0999999999989 | 1.49 | -1.49 |  |
| 57.1499999999989 | 1.489 | -1.489 |  |
| 57.19999999999888 | 1.488 | -1.488 |  |
| 57.24999999999888 | 1.487 | -1.487 |  |
| 57.29999999999888 | 1.486 | -1.486 |  |
| 57.34999999999888 | 1.485 | -1.485 |  |
| 57.39999999999887 | 1.484 | -1.484 |  |
| 57.44999999999887 | 1.483 | -1.483 |  |
| 57.49999999999887 | 1.481 | -1.481 |  |
| 57.54999999999887 | 1.48 | -1.48 |  |
| 57.59999999999886 | 1.479 | -1.479 |  |
| 57.64999999999886 | 1.478 | -1.478 |  |
| 57.69999999999885 | 1.477 | -1.477 |  |
| 57.74999999999885 | 1.476 | -1.476 |  |
| 57.79999999999885 | 1.475 | -1.475 |  |
| 57.84999999999885 | 1.474 | -1.474 |  |
| 57.89999999999884 | 1.473 | -1.473 |  |
| 57.94999999999884 | 1.472 | -1.472 |  |
| 57.99999999999884 | 1.471 | -1.471 |  |
| 58.04999999999884 | 1.47 | -1.47 |  |
| 58.09999999999883 | 1.468 | -1.468 |  |
| 58.14999999999883 | 1.467 | -1.467 |  |
| 58.19999999999883 | 1.466 | -1.466 |  |
| 58.24999999999882 | 1.465 | -1.465 |  |
| 58.29999999999882 | 1.464 | -1.464 |  |
| 58.34999999999882 | 1.463 | -1.463 |  |
| 58.39999999999882 | 1.462 | -1.462 |  |
| 58.44999999999882 | 1.461 | -1.461 |  |
| 58.49999999999881 | 1.46 | -1.46 |  |
| 58.54999999999881 | 1.459 | -1.459 |  |
| 58.5999999999988 | 1.458 | -1.458 |  |
| 58.6499999999988 | 1.457 | -1.457 |  |
| 58.6999999999988 | 1.456 | -1.456 |  |
| 58.7499999999988 | 1.455 | -1.455 |  |
| 58.7999999999988 | 1.453 | -1.453 |  |
| 58.8499999999988 | 1.452 | -1.452 |  |
| 58.8999999999988 | 1.451 | -1.451 |  |
| 58.94999999999879 | 1.45 | -1.45 |  |
| 58.99999999999878 | 1.449 | -1.449 |  |
| 59.04999999999878 | 1.448 | -1.448 |  |
| 59.09999999999877 | 1.447 | -1.447 |  |
| 59.14999999999877 | 1.446 | -1.446 |  |
| 59.19999999999877 | 1.445 | -1.445 |  |
| 59.24999999999877 | 1.444 | -1.444 |  |
| 59.29999999999876 | 1.443 | -1.443 |  |
| 59.34999999999877 | 1.442 | -1.442 |  |
| 59.39999999999876 | 1.441 | -1.441 |  |
| 59.44999999999876 | 1.44 | -1.44 |  |
| 59.49999999999875 | 1.439 | -1.439 |  |
| 59.54999999999875 | 1.438 | -1.438 |  |
| 59.59999999999875 | 1.437 | -1.437 |  |
| 59.64999999999874 | 1.436 | -1.436 |  |
| 59.69999999999874 | 1.435 | -1.435 |  |
| 59.74999999999874 | 1.434 | -1.434 |  |
| 59.79999999999873 | 1.433 | -1.433 |  |
| 59.84999999999874 | 1.432 | -1.432 |  |
| 59.89999999999873 | 1.431 | -1.431 |  |
| 59.94999999999873 | 1.43 | -1.43 |  |
| 59.99999999999872 | 1.429 | -1.429 |  |
| 60.04999999999872 | 1.428 | -1.428 |  |
| 60.09999999999872 | 1.427 | -1.427 |  |
| 60.14999999999872 | 1.426 | -1.426 |  |
| 60.19999999999871 | 1.425 | -1.425 |  |
| 60.24999999999871 | 1.423 | -1.423 |  |
| 60.2999999999987 | 1.422 | -1.422 |  |
| 60.34999999999871 | 1.421 | -1.421 |  |
| 60.3999999999987 | 1.42 | -1.42 |  |
| 60.4499999999987 | 1.419 | -1.419 |  |
| 60.4999999999987 | 1.418 | -1.418 |  |
| 60.5499999999987 | 1.417 | -1.417 |  |
| 60.5999999999987 | 1.416 | -1.416 |  |
| 60.6499999999987 | 1.415 | -1.415 |  |
| 60.69999999999869 | 1.414 | -1.414 |  |
| 60.74999999999869 | 1.413 | -1.413 |  |
| 60.79999999999868 | 1.412 | -1.412 |  |
| 60.84999999999868 | 1.411 | -1.411 |  |
| 60.89999999999868 | 1.41 | -1.41 |  |
| 60.94999999999867 | 1.409 | -1.409 |  |
| 60.99999999999867 | 1.408 | -1.408 |  |
| 61.04999999999867 | 1.407 | -1.407 |  |
| 61.09999999999867 | 1.406 | -1.406 |  |
| 61.14999999999866 | 1.405 | -1.405 |  |
| 61.19999999999866 | 1.404 | -1.404 |  |
| 61.24999999999866 | 1.404 | -1.404 |  |
| 61.29999999999865 | 1.403 | -1.403 |  |
| 61.34999999999865 | 1.402 | -1.402 |  |
| 61.39999999999865 | 1.401 | -1.401 |  |
| 61.44999999999865 | 1.4 | -1.4 |  |
| 61.49999999999864 | 1.399 | -1.399 |  |
| 61.54999999999864 | 1.398 | -1.398 |  |
| 61.59999999999864 | 1.397 | -1.397 |  |
| 61.64999999999863 | 1.396 | -1.396 |  |
| 61.69999999999863 | 1.395 | -1.395 |  |
| 61.74999999999863 | 1.394 | -1.394 |  |
| 61.79999999999862 | 1.393 | -1.393 |  |
| 61.84999999999862 | 1.392 | -1.392 |  |
| 61.89999999999862 | 1.391 | -1.391 |  |
| 61.94999999999862 | 1.39 | -1.39 |  |
| 61.99999999999861 | 1.389 | -1.389 |  |
| 62.04999999999861 | 1.388 | -1.388 |  |
| 62.09999999999861 | 1.387 | -1.387 |  |
| 62.14999999999861 | 1.386 | -1.386 |  |
| 62.1999999999986 | 1.385 | -1.385 |  |
| 62.2499999999986 | 1.384 | -1.384 |  |
| 62.2999999999986 | 1.383 | -1.383 |  |
| 62.34999999999859 | 1.382 | -1.382 |  |
| 62.3999999999986 | 1.381 | -1.381 |  |
| 62.44999999999859 | 1.38 | -1.38 |  |
| 62.49999999999859 | 1.379 | -1.379 |  |
| 62.54999999999858 | 1.378 | -1.378 |  |
| 62.59999999999858 | 1.377 | -1.377 |  |
| 62.64999999999858 | 1.376 | -1.376 |  |
| 62.69999999999857 | 1.376 | -1.376 |  |
| 62.74999999999857 | 1.375 | -1.375 |  |
| 62.79999999999857 | 1.374 | -1.374 |  |
| 62.84999999999857 | 1.373 | -1.373 |  |
| 62.89999999999856 | 1.372 | -1.372 |  |
| 62.94999999999856 | 1.371 | -1.371 |  |
| 62.99999999999856 | 1.37 | -1.37 |  |
| 63.04999999999855 | 1.369 | -1.369 |  |
| 63.09999999999855 | 1.368 | -1.368 |  |
| 63.14999999999855 | 1.367 | -1.367 |  |
| 63.19999999999854 | 1.366 | -1.366 |  |
| 63.24999999999854 | 1.365 | -1.365 |  |
| 63.29999999999854 | 1.364 | -1.364 |  |
| 63.34999999999854 | 1.363 | -1.363 |  |
| 63.39999999999853 | 1.362 | -1.362 |  |
| 63.44999999999853 | 1.361 | -1.361 |  |
| 63.49999999999853 | 1.361 | -1.361 |  |
| 63.54999999999853 | 1.36 | -1.36 |  |
| 63.59999999999852 | 1.359 | -1.359 |  |
| 63.64999999999852 | 1.358 | -1.358 |  |
| 63.69999999999852 | 1.357 | -1.357 |  |
| 63.74999999999851 | 1.356 | -1.356 |  |
| 63.79999999999851 | 1.355 | -1.355 |  |
| 63.84999999999851 | 1.354 | -1.354 |  |
| 63.89999999999851 | 1.353 | -1.353 |  |
| 63.9499999999985 | 1.352 | -1.352 |  |
| 63.9999999999985 | 1.351 | -1.351 |  |
| 64.0499999999985 | 1.35 | -1.35 |  |
| 64.0999999999985 | 1.35 | -1.35 |  |
| 64.1499999999985 | 1.349 | -1.349 |  |
| 64.1999999999985 | 1.348 | -1.348 |  |
| 64.2499999999985 | 1.347 | -1.347 |  |
| 64.2999999999985 | 1.346 | -1.346 |  |
| 64.34999999999847 | 1.345 | -1.345 |  |
| 64.39999999999849 | 1.344 | -1.344 |  |
| 64.44999999999848 | 1.343 | -1.343 |  |
| 64.49999999999847 | 1.342 | -1.342 |  |
| 64.54999999999848 | 1.341 | -1.341 |  |
| 64.59999999999847 | 1.34 | -1.34 |  |
| 64.64999999999847 | 1.34 | -1.34 |  |
| 64.69999999999845 | 1.339 | -1.339 |  |
| 64.74999999999847 | 1.338 | -1.338 |  |
| 64.79999999999846 | 1.337 | -1.337 |  |
| 64.84999999999845 | 1.336 | -1.336 |  |
| 64.89999999999846 | 1.335 | -1.335 |  |
| 64.94999999999845 | 1.334 | -1.334 |  |
| 64.99999999999845 | 1.333 | -1.333 |  |
| 65.04999999999843 | 1.332 | -1.332 |  |
| 65.09999999999845 | 1.332 | -1.332 |  |
| 65.14999999999844 | 1.331 | -1.331 |  |
| 65.19999999999843 | 1.33 | -1.33 |  |
| 65.24999999999844 | 1.329 | -1.329 |  |
| 65.29999999999843 | 1.328 | -1.328 |  |
| 65.34999999999843 | 1.327 | -1.327 |  |
| 65.39999999999841 | 1.326 | -1.326 |  |
| 65.4499999999984 | 1.325 | -1.325 |  |
| 65.4999999999984 | 1.325 | -1.325 |  |
| 65.5499999999984 | 1.324 | -1.324 |  |
| 65.5999999999984 | 1.323 | -1.323 |  |
| 65.6499999999984 | 1.322 | -1.322 |  |
| 65.6999999999984 | 1.321 | -1.321 |  |
| 65.7499999999984 | 1.32 | -1.32 |  |
| 65.7999999999984 | 1.319 | -1.319 |  |
| 65.8499999999984 | 1.318 | -1.318 |  |
| 65.8999999999984 | 1.318 | -1.318 |  |
| 65.9499999999984 | 1.317 | -1.317 |  |
| 65.9999999999984 | 1.316 | -1.316 |  |
| 66.0499999999984 | 1.315 | -1.315 |  |
| 66.09999999999837 | 1.314 | -1.314 |  |
| 66.14999999999839 | 1.313 | -1.313 |  |
| 66.19999999999838 | 1.312 | -1.312 |  |
| 66.24999999999837 | 1.311 | -1.311 |  |
| 66.29999999999836 | 1.311 | -1.311 |  |
| 66.34999999999837 | 1.31 | -1.31 |  |
| 66.39999999999837 | 1.309 | -1.309 |  |
| 66.44999999999835 | 1.308 | -1.308 |  |
| 66.49999999999837 | 1.307 | -1.307 |  |
| 66.54999999999836 | 1.306 | -1.306 |  |
| 66.59999999999836 | 1.305 | -1.305 |  |
| 66.64999999999834 | 1.305 | -1.305 |  |
| 66.69999999999835 | 1.304 | -1.304 |  |
| 66.74999999999835 | 1.303 | -1.303 |  |
| 66.79999999999833 | 1.302 | -1.302 |  |
| 66.84999999999835 | 1.301 | -1.301 |  |
| 66.89999999999834 | 1.3 | -1.3 |  |
| 66.94999999999834 | 1.3 | -1.3 |  |
| 66.99999999999832 | 1.299 | -1.299 |  |
| 67.04999999999833 | 1.298 | -1.298 |  |
| 67.09999999999833 | 1.297 | -1.297 |  |
| 67.14999999999831 | 1.296 | -1.296 |  |
| 67.19999999999833 | 1.295 | -1.295 |  |
| 67.2499999999983 | 1.294 | -1.294 |  |
| 67.2999999999983 | 1.294 | -1.294 |  |
| 67.3499999999983 | 1.293 | -1.293 |  |
| 67.3999999999983 | 1.292 | -1.292 |  |
| 67.4499999999983 | 1.291 | -1.291 |  |
| 67.4999999999983 | 1.29 | -1.29 |  |
| 67.5499999999983 | 1.289 | -1.289 |  |
| 67.5999999999983 | 1.289 | -1.289 |  |
| 67.6499999999983 | 1.288 | -1.288 |  |
| 67.6999999999983 | 1.287 | -1.287 |  |
| 67.7499999999983 | 1.286 | -1.286 |  |
| 67.7999999999983 | 1.285 | -1.285 |  |
| 67.84999999999827 | 1.285 | -1.285 |  |
| 67.89999999999829 | 1.284 | -1.284 |  |
| 67.94999999999828 | 1.283 | -1.283 |  |
| 67.99999999999828 | 1.282 | -1.282 |  |
| 68.04999999999826 | 1.281 | -1.281 |  |
| 68.09999999999827 | 1.28 | -1.28 |  |
| 68.14999999999827 | 1.28 | -1.28 |  |
| 68.19999999999825 | 1.279 | -1.279 |  |
| 68.24999999999827 | 1.278 | -1.278 |  |
| 68.29999999999826 | 1.277 | -1.277 |  |
| 68.34999999999826 | 1.276 | -1.276 |  |
| 68.39999999999824 | 1.276 | -1.276 |  |
| 68.44999999999825 | 1.275 | -1.275 |  |
| 68.49999999999825 | 1.274 | -1.274 |  |
| 68.54999999999824 | 1.273 | -1.273 |  |
| 68.59999999999825 | 1.272 | -1.272 |  |
| 68.64999999999824 | 1.271 | -1.271 |  |
| 68.69999999999824 | 1.271 | -1.271 |  |
| 68.74999999999822 | 1.27 | -1.27 |  |
| 68.79999999999824 | 1.269 | -1.269 |  |
| 68.84999999999823 | 1.268 | -1.268 |  |
| 68.89999999999822 | 1.267 | -1.267 |  |
| 68.9499999999982 | 1.267 | -1.267 |  |
| 68.9999999999982 | 1.266 | -1.266 |  |
| 69.0499999999982 | 1.265 | -1.265 |  |
| 69.0999999999982 | 1.264 | -1.264 |  |
| 69.1499999999982 | 1.263 | -1.263 |  |
| 69.1999999999982 | 1.263 | -1.263 |  |
| 69.2499999999982 | 1.262 | -1.262 |  |
| 69.2999999999982 | 1.261 | -1.261 |  |
| 69.3499999999982 | 1.26 | -1.26 |  |
| 69.3999999999982 | 1.259 | -1.259 |  |
| 69.4499999999982 | 1.259 | -1.259 |  |
| 69.4999999999982 | 1.258 | -1.258 |  |
| 69.5499999999982 | 1.257 | -1.257 |  |
| 69.59999999999818 | 1.256 | -1.256 |  |
| 69.64999999999819 | 1.255 | -1.255 |  |
| 69.69999999999818 | 1.255 | -1.255 |  |
| 69.74999999999818 | 1.254 | -1.254 |  |
| 69.79999999999816 | 1.253 | -1.253 |  |
| 69.84999999999818 | 1.252 | -1.252 |  |
| 69.89999999999817 | 1.252 | -1.252 |  |
| 69.94999999999816 | 1.251 | -1.251 |  |
| 69.99999999999817 | 1.25 | -1.25 |  |
| 70.04999999999816 | 1.249 | -1.249 |  |
| 70.09999999999816 | 1.248 | -1.248 |  |
| 70.14999999999814 | 1.248 | -1.248 |  |
| 70.19999999999816 | 1.247 | -1.247 |  |
| 70.24999999999815 | 1.246 | -1.246 |  |
| 70.29999999999814 | 1.245 | -1.245 |  |
| 70.34999999999815 | 1.245 | -1.245 |  |
| 70.39999999999814 | 1.244 | -1.244 |  |
| 70.44999999999814 | 1.243 | -1.243 |  |
| 70.49999999999812 | 1.242 | -1.242 |  |
| 70.54999999999814 | 1.241 | -1.241 |  |
| 70.59999999999813 | 1.241 | -1.241 |  |
| 70.64999999999812 | 1.24 | -1.24 |  |
| 70.69999999999813 | 1.239 | -1.239 |  |
| 70.7499999999981 | 1.238 | -1.238 |  |
| 70.7999999999981 | 1.238 | -1.238 |  |
| 70.8499999999981 | 1.237 | -1.237 |  |
| 70.8999999999981 | 1.236 | -1.236 |  |
| 70.9499999999981 | 1.235 | -1.235 |  |
| 70.9999999999981 | 1.235 | -1.235 |  |
| 71.0499999999981 | 1.234 | -1.234 |  |
| 71.0999999999981 | 1.233 | -1.233 |  |
| 71.1499999999981 | 1.232 | -1.232 |  |
| 71.1999999999981 | 1.232 | -1.232 |  |
| 71.2499999999981 | 1.231 | -1.231 |  |
| 71.2999999999981 | 1.23 | -1.23 |  |
| 71.3499999999981 | 1.229 | -1.229 |  |
| 71.39999999999807 | 1.229 | -1.229 |  |
| 71.44999999999808 | 1.228 | -1.228 |  |
| 71.49999999999808 | 1.227 | -1.227 |  |
| 71.54999999999806 | 1.226 | -1.226 |  |
| 71.59999999999808 | 1.225 | -1.225 |  |
| 71.64999999999807 | 1.225 | -1.225 |  |
| 71.69999999999807 | 1.224 | -1.224 |  |
| 71.74999999999805 | 1.223 | -1.223 |  |
| 71.79999999999806 | 1.222 | -1.222 |  |
| 71.84999999999806 | 1.222 | -1.222 |  |
| 71.89999999999804 | 1.221 | -1.221 |  |
| 71.94999999999806 | 1.22 | -1.22 |  |
| 71.99999999999805 | 1.22 | -1.22 |  |
| 72.04999999999805 | 1.219 | -1.219 |  |
| 72.09999999999803 | 1.218 | -1.218 |  |
| 72.14999999999804 | 1.217 | -1.217 |  |
| 72.19999999999804 | 1.217 | -1.217 |  |
| 72.24999999999802 | 1.216 | -1.216 |  |
| 72.29999999999804 | 1.215 | -1.215 |  |
| 72.34999999999803 | 1.214 | -1.214 |  |
| 72.39999999999803 | 1.214 | -1.214 |  |
| 72.449999999998 | 1.213 | -1.213 |  |
| 72.499999999998 | 1.212 | -1.212 |  |
| 72.549999999998 | 1.211 | -1.211 |  |
| 72.599999999998 | 1.211 | -1.211 |  |
| 72.649999999998 | 1.21 | -1.21 |  |
| 72.699999999998 | 1.209 | -1.209 |  |
| 72.749999999998 | 1.208 | -1.208 |  |
| 72.799999999998 | 1.208 | -1.208 |  |
| 72.849999999998 | 1.207 | -1.207 |  |
| 72.899999999998 | 1.206 | -1.206 |  |
| 72.949999999998 | 1.206 | -1.206 |  |
| 72.999999999998 | 1.205 | -1.205 |  |
| 73.049999999998 | 1.204 | -1.204 |  |
| 73.099999999998 | 1.203 | -1.203 |  |
| 73.14999999999797 | 1.203 | -1.203 |  |
| 73.19999999999798 | 1.202 | -1.202 |  |
| 73.24999999999798 | 1.201 | -1.201 |  |
| 73.29999999999797 | 1.2 | -1.2 |  |
| 73.34999999999798 | 1.2 | -1.2 |  |
| 73.39999999999797 | 1.199 | -1.199 |  |
| 73.44999999999797 | 1.198 | -1.198 |  |
| 73.49999999999795 | 1.198 | -1.198 |  |
| 73.54999999999797 | 1.197 | -1.197 |  |
| 73.59999999999796 | 1.196 | -1.196 |  |
| 73.64999999999795 | 1.195 | -1.195 |  |
| 73.69999999999796 | 1.195 | -1.195 |  |
| 73.74999999999795 | 1.194 | -1.194 |  |
| 73.79999999999795 | 1.193 | -1.193 |  |
| 73.84999999999793 | 1.193 | -1.193 |  |
| 73.89999999999795 | 1.192 | -1.192 |  |
| 73.94999999999794 | 1.191 | -1.191 |  |
| 73.99999999999793 | 1.19 | -1.19 |  |
| 74.04999999999794 | 1.19 | -1.19 |  |
| 74.09999999999793 | 1.189 | -1.189 |  |
| 74.14999999999793 | 1.188 | -1.188 |  |
| 74.19999999999791 | 1.188 | -1.188 |  |
| 74.2499999999979 | 1.187 | -1.187 |  |
| 74.2999999999979 | 1.186 | -1.186 |  |
| 74.3499999999979 | 1.186 | -1.186 |  |
| 74.3999999999979 | 1.185 | -1.185 |  |
| 74.4499999999979 | 1.184 | -1.184 |  |
| 74.4999999999979 | 1.183 | -1.183 |  |
| 74.5499999999979 | 1.183 | -1.183 |  |
| 74.5999999999979 | 1.182 | -1.182 |  |
| 74.6499999999979 | 1.181 | -1.181 |  |
| 74.6999999999979 | 1.181 | -1.181 |  |
| 74.7499999999979 | 1.18 | -1.18 |  |
| 74.7999999999979 | 1.179 | -1.179 |  |
| 74.8499999999979 | 1.179 | -1.179 |  |
| 74.89999999999787 | 1.178 | -1.178 |  |
| 74.94999999999789 | 1.177 | -1.177 |  |
| 74.99999999999788 | 1.176 | -1.176 |  |
| 75.04999999999787 | 1.176 | -1.176 |  |
| 75.09999999999788 | 1.175 | -1.175 |  |
| 75.14999999999787 | 1.174 | -1.174 |  |
| 75.19999999999787 | 1.174 | -1.174 |  |
| 75.24999999999785 | 1.173 | -1.173 |  |
| 75.29999999999787 | 1.172 | -1.172 |  |
| 75.34999999999786 | 1.172 | -1.172 |  |
| 75.39999999999785 | 1.171 | -1.171 |  |
| 75.44999999999786 | 1.17 | -1.17 |  |
| 75.49999999999785 | 1.17 | -1.17 |  |
| 75.54999999999785 | 1.169 | -1.169 |  |
| 75.59999999999783 | 1.168 | -1.168 |  |
| 75.64999999999785 | 1.168 | -1.168 |  |
| 75.69999999999784 | 1.167 | -1.167 |  |
| 75.74999999999783 | 1.166 | -1.166 |  |
| 75.79999999999782 | 1.166 | -1.166 |  |
| 75.84999999999783 | 1.165 | -1.165 |  |
| 75.89999999999783 | 1.164 | -1.164 |  |
| 75.9499999999978 | 1.163 | -1.163 |  |
| 75.9999999999978 | 1.163 | -1.163 |  |
| 76.0499999999978 | 1.162 | -1.162 |  |
| 76.0999999999978 | 1.161 | -1.161 |  |
| 76.1499999999978 | 1.161 | -1.161 |  |
| 76.1999999999978 | 1.16 | -1.16 |  |
| 76.2499999999978 | 1.159 | -1.159 |  |
| 76.2999999999978 | 1.159 | -1.159 |  |
| 76.3499999999978 | 1.158 | -1.158 |  |
| 76.3999999999978 | 1.157 | -1.157 |  |
| 76.4499999999978 | 1.157 | -1.157 |  |
| 76.4999999999978 | 1.156 | -1.156 |  |
| 76.5499999999978 | 1.155 | -1.155 |  |
| 76.5999999999978 | 1.155 | -1.155 |  |
| 76.64999999999777 | 1.154 | -1.154 |  |
| 76.69999999999779 | 1.153 | -1.153 |  |
| 76.74999999999778 | 1.153 | -1.153 |  |
| 76.79999999999778 | 1.152 | -1.152 |  |
| 76.84999999999776 | 1.151 | -1.151 |  |
| 76.89999999999777 | 1.151 | -1.151 |  |
| 76.94999999999777 | 1.15 | -1.15 |  |
| 76.99999999999775 | 1.149 | -1.149 |  |
| 77.04999999999777 | 1.149 | -1.149 |  |
| 77.09999999999776 | 1.148 | -1.148 |  |
| 77.14999999999776 | 1.147 | -1.147 |  |
| 77.19999999999774 | 1.147 | -1.147 |  |
| 77.24999999999775 | 1.146 | -1.146 |  |
| 77.29999999999775 | 1.145 | -1.145 |  |
| 77.34999999999773 | 1.145 | -1.145 |  |
| 77.39999999999775 | 1.144 | -1.144 |  |
| 77.44999999999774 | 1.144 | -1.144 |  |
| 77.49999999999774 | 1.143 | -1.143 |  |
| 77.54999999999772 | 1.142 | -1.142 |  |
| 77.59999999999773 | 1.142 | -1.142 |  |
| 77.64999999999773 | 1.141 | -1.141 |  |
| 77.69999999999771 | 1.14 | -1.14 |  |
| 77.7499999999977 | 1.14 | -1.14 |  |
| 77.7999999999977 | 1.139 | -1.139 |  |
| 77.8499999999977 | 1.138 | -1.138 |  |
| 77.8999999999977 | 1.138 | -1.138 |  |
| 77.9499999999977 | 1.137 | -1.137 |  |
| 77.9999999999977 | 1.136 | -1.136 |  |
| 78.0499999999977 | 1.136 | -1.136 |  |
| 78.0999999999977 | 1.135 | -1.135 |  |
| 78.1499999999977 | 1.134 | -1.134 |  |
| 78.1999999999977 | 1.134 | -1.134 |  |
| 78.2499999999977 | 1.133 | -1.133 |  |
| 78.2999999999977 | 1.133 | -1.133 |  |
| 78.3499999999977 | 1.132 | -1.132 |  |
| 78.39999999999768 | 1.131 | -1.131 |  |
| 78.44999999999769 | 1.131 | -1.131 |  |
| 78.49999999999768 | 1.13 | -1.13 |  |
| 78.54999999999768 | 1.129 | -1.129 |  |
| 78.59999999999766 | 1.129 | -1.129 |  |
| 78.64999999999768 | 1.128 | -1.128 |  |
| 78.69999999999767 | 1.127 | -1.127 |  |
| 78.74999999999766 | 1.127 | -1.127 |  |
| 78.79999999999767 | 1.126 | -1.126 |  |
| 78.84999999999766 | 1.125 | -1.125 |  |
| 78.89999999999766 | 1.125 | -1.125 |  |
| 78.94999999999764 | 1.124 | -1.124 |  |
| 78.99999999999766 | 1.124 | -1.124 |  |
| 79.04999999999765 | 1.123 | -1.123 |  |
| 79.09999999999764 | 1.122 | -1.122 |  |
| 79.14999999999765 | 1.122 | -1.122 |  |
| 79.19999999999764 | 1.121 | -1.121 |  |
| 79.24999999999764 | 1.12 | -1.12 |  |
| 79.29999999999762 | 1.12 | -1.12 |  |
| 79.34999999999764 | 1.119 | -1.119 |  |
| 79.39999999999763 | 1.119 | -1.119 |  |
| 79.4499999999976 | 1.118 | -1.118 |  |
| 79.4999999999976 | 1.117 | -1.117 |  |
| 79.5499999999976 | 1.117 | -1.117 |  |
| 79.5999999999976 | 1.116 | -1.116 |  |
| 79.6499999999976 | 1.115 | -1.115 |  |
| 79.6999999999976 | 1.115 | -1.115 |  |
| 79.7499999999976 | 1.114 | -1.114 |  |
| 79.7999999999976 | 1.114 | -1.114 |  |
| 79.8499999999976 | 1.113 | -1.113 |  |
| 79.8999999999976 | 1.112 | -1.112 |  |
| 79.9499999999976 | 1.112 | -1.112 |  |
| 79.9999999999976 | 1.111 | -1.111 |  |
| 80.0499999999976 | 1.11 | -1.11 |  |
| 80.0999999999976 | 1.11 | -1.11 |  |
| 80.14999999999758 | 1.109 | -1.109 |  |
| 80.19999999999759 | 1.109 | -1.109 |  |
| 80.24999999999758 | 1.108 | -1.108 |  |
| 80.29999999999758 | 1.107 | -1.107 |  |
| 80.34999999999756 | 1.107 | -1.107 |  |
| 80.39999999999758 | 1.106 | -1.106 |  |
| 80.44999999999757 | 1.106 | -1.106 |  |
| 80.49999999999756 | 1.105 | -1.105 |  |
| 80.54999999999757 | 1.104 | -1.104 |  |
| 80.59999999999756 | 1.104 | -1.104 |  |
| 80.64999999999756 | 1.103 | -1.103 |  |
| 80.69999999999754 | 1.103 | -1.103 |  |
| 80.74999999999756 | 1.102 | -1.102 |  |
| 80.79999999999755 | 1.101 | -1.101 |  |
| 80.84999999999754 | 1.101 | -1.101 |  |
| 80.89999999999753 | 1.1 | -1.1 |  |
| 80.94999999999754 | 1.1 | -1.1 |  |
| 80.99999999999754 | 1.099 | -1.099 |  |
| 81.04999999999752 | 1.098 | -1.098 |  |
| 81.09999999999754 | 1.098 | -1.098 |  |
| 81.14999999999753 | 1.097 | -1.097 |  |
| 81.19999999999753 | 1.096 | -1.096 |  |
| 81.2499999999975 | 1.096 | -1.096 |  |
| 81.2999999999975 | 1.095 | -1.095 |  |
| 81.3499999999975 | 1.095 | -1.095 |  |
| 81.3999999999975 | 1.094 | -1.094 |  |
| 81.4499999999975 | 1.093 | -1.093 |  |
| 81.4999999999975 | 1.093 | -1.093 |  |
| 81.5499999999975 | 1.092 | -1.092 |  |
| 81.5999999999975 | 1.092 | -1.092 |  |
| 81.6499999999975 | 1.091 | -1.091 |  |
| 81.6999999999975 | 1.091 | -1.091 |  |
| 81.7499999999975 | 1.09 | -1.09 |  |
| 81.7999999999975 | 1.089 | -1.089 |  |
| 81.8499999999975 | 1.089 | -1.089 |  |
| 81.8999999999975 | 1.088 | -1.088 |  |
| 81.94999999999747 | 1.088 | -1.088 |  |
| 81.99999999999748 | 1.087 | -1.087 |  |
| 82.04999999999748 | 1.086 | -1.086 |  |
| 82.09999999999746 | 1.086 | -1.086 |  |
| 82.14999999999748 | 1.085 | -1.085 |  |
| 82.19999999999747 | 1.085 | -1.085 |  |
| 82.24999999999747 | 1.084 | -1.084 |  |
| 82.29999999999745 | 1.083 | -1.083 |  |
| 82.34999999999746 | 1.083 | -1.083 |  |
| 82.39999999999746 | 1.082 | -1.082 |  |
| 82.44999999999744 | 1.082 | -1.082 |  |
| 82.49999999999746 | 1.081 | -1.081 |  |
| 82.54999999999745 | 1.08 | -1.08 |  |
| 82.59999999999745 | 1.08 | -1.08 |  |
| 82.64999999999743 | 1.079 | -1.079 |  |
| 82.69999999999744 | 1.079 | -1.079 |  |
| 82.74999999999744 | 1.078 | -1.078 |  |
| 82.79999999999742 | 1.078 | -1.078 |  |
| 82.84999999999744 | 1.077 | -1.077 |  |
| 82.89999999999743 | 1.076 | -1.076 |  |
| 82.9499999999974 | 1.076 | -1.076 |  |
| 82.9999999999974 | 1.075 | -1.075 |  |
| 83.0499999999974 | 1.075 | -1.075 |  |
| 83.0999999999974 | 1.074 | -1.074 |  |
| 83.1499999999974 | 1.074 | -1.074 |  |
| 83.1999999999974 | 1.073 | -1.073 |  |
| 83.2499999999974 | 1.072 | -1.072 |  |
| 83.2999999999974 | 1.072 | -1.072 |  |
| 83.3499999999974 | 1.071 | -1.071 |  |
| 83.3999999999974 | 1.071 | -1.071 |  |
| 83.4499999999974 | 1.07 | -1.07 |  |
| 83.4999999999974 | 1.07 | -1.07 |  |
| 83.5499999999974 | 1.069 | -1.069 |  |
| 83.5999999999974 | 1.068 | -1.068 |  |
| 83.6499999999974 | 1.068 | -1.068 |  |
| 83.69999999999737 | 1.067 | -1.067 |  |
| 83.74999999999739 | 1.067 | -1.067 |  |
| 83.79999999999738 | 1.066 | -1.066 |  |
| 83.84999999999737 | 1.066 | -1.066 |  |
| 83.89999999999738 | 1.065 | -1.065 |  |
| 83.94999999999737 | 1.064 | -1.064 |  |
| 83.99999999999737 | 1.064 | -1.064 |  |
| 84.04999999999735 | 1.063 | -1.063 |  |
| 84.09999999999737 | 1.063 | -1.063 |  |
| 84.14999999999736 | 1.062 | -1.062 |  |
| 84.19999999999735 | 1.062 | -1.062 |  |
| 84.24999999999736 | 1.061 | -1.061 |  |
| 84.29999999999735 | 1.06 | -1.06 |  |
| 84.34999999999735 | 1.06 | -1.06 |  |
| 84.39999999999733 | 1.059 | -1.059 |  |
| 84.44999999999735 | 1.059 | -1.059 |  |
| 84.49999999999734 | 1.058 | -1.058 |  |
| 84.54999999999733 | 1.058 | -1.058 |  |
| 84.59999999999734 | 1.057 | -1.057 |  |
| 84.64999999999733 | 1.057 | -1.057 |  |
| 84.69999999999733 | 1.056 | -1.056 |  |
| 84.7499999999973 | 1.055 | -1.055 |  |
| 84.7999999999973 | 1.055 | -1.055 |  |
| 84.8499999999973 | 1.054 | -1.054 |  |
| 84.8999999999973 | 1.054 | -1.054 |  |
| 84.9499999999973 | 1.053 | -1.053 |  |
| 84.9999999999973 | 1.053 | -1.053 |  |
| 85.0499999999973 | 1.052 | -1.052 |  |
| 85.0999999999973 | 1.052 | -1.052 |  |
| 85.1499999999973 | 1.051 | -1.051 |  |
| 85.1999999999973 | 1.05 | -1.05 |  |
| 85.2499999999973 | 1.05 | -1.05 |  |
| 85.2999999999973 | 1.049 | -1.049 |  |
| 85.3499999999973 | 1.049 | -1.049 |  |
| 85.3999999999973 | 1.048 | -1.048 |  |
| 85.44999999999727 | 1.048 | -1.048 |  |
| 85.49999999999729 | 1.047 | -1.047 |  |
| 85.54999999999728 | 1.047 | -1.047 |  |
| 85.59999999999728 | 1.046 | -1.046 |  |
| 85.64999999999726 | 1.045 | -1.045 |  |
| 85.69999999999727 | 1.045 | -1.045 |  |
| 85.74999999999727 | 1.044 | -1.044 |  |
| 85.79999999999725 | 1.044 | -1.044 |  |
| 85.84999999999727 | 1.043 | -1.043 |  |
| 85.89999999999726 | 1.043 | -1.043 |  |
| 85.94999999999726 | 1.042 | -1.042 |  |
| 85.99999999999724 | 1.042 | -1.042 |  |
| 86.04999999999725 | 1.041 | -1.041 |  |
| 86.09999999999725 | 1.041 | -1.041 |  |
| 86.14999999999723 | 1.04 | -1.04 |  |
| 86.19999999999725 | 1.04 | -1.04 |  |
| 86.24999999999724 | 1.039 | -1.039 |  |
| 86.29999999999724 | 1.038 | -1.038 |  |
| 86.34999999999722 | 1.038 | -1.038 |  |
| 86.39999999999723 | 1.037 | -1.037 |  |
| 86.4499999999972 | 1.037 | -1.037 |  |
| 86.4999999999972 | 1.036 | -1.036 |  |
| 86.5499999999972 | 1.036 | -1.036 |  |
| 86.5999999999972 | 1.035 | -1.035 |  |
| 86.6499999999972 | 1.035 | -1.035 |  |
| 86.6999999999972 | 1.034 | -1.034 |  |
| 86.7499999999972 | 1.034 | -1.034 |  |
| 86.7999999999972 | 1.033 | -1.033 |  |
| 86.8499999999972 | 1.033 | -1.033 |  |
| 86.8999999999972 | 1.032 | -1.032 |  |
| 86.9499999999972 | 1.031 | -1.031 |  |
| 86.9999999999972 | 1.031 | -1.031 |  |
| 87.0499999999972 | 1.03 | -1.03 |  |
| 87.0999999999972 | 1.03 | -1.03 |  |
| 87.1499999999972 | 1.029 | -1.029 |  |
| 87.19999999999717 | 1.029 | -1.029 |  |
| 87.24999999999719 | 1.028 | -1.028 |  |
| 87.29999999999718 | 1.028 | -1.028 |  |
| 87.34999999999718 | 1.027 | -1.027 |  |
| 87.39999999999716 | 1.027 | -1.027 |  |
| 87.44999999999717 | 1.026 | -1.026 |  |
| 87.49999999999717 | 1.026 | -1.026 |  |
| 87.54999999999715 | 1.025 | -1.025 |  |
| 87.59999999999717 | 1.025 | -1.025 |  |
| 87.64999999999716 | 1.024 | -1.024 |  |
| 87.69999999999716 | 1.024 | -1.024 |  |
| 87.74999999999714 | 1.023 | -1.023 |  |
| 87.79999999999715 | 1.022 | -1.022 |  |
| 87.84999999999715 | 1.022 | -1.022 |  |
| 87.89999999999714 | 1.021 | -1.021 |  |
| 87.94999999999715 | 1.021 | -1.021 |  |
| 87.99999999999714 | 1.02 | -1.02 |  |
| 88.04999999999714 | 1.02 | -1.02 |  |
| 88.09999999999712 | 1.019 | -1.019 |  |
| 88.14999999999714 | 1.019 | -1.019 |  |
| 88.19999999999713 | 1.018 | -1.018 |  |
| 88.2499999999971 | 1.018 | -1.018 |  |
| 88.2999999999971 | 1.017 | -1.017 |  |
| 88.3499999999971 | 1.017 | -1.017 |  |
| 88.3999999999971 | 1.016 | -1.016 |  |
| 88.4499999999971 | 1.016 | -1.016 |  |
| 88.4999999999971 | 1.015 | -1.015 |  |
| 88.5499999999971 | 1.015 | -1.015 |  |
| 88.5999999999971 | 1.014 | -1.014 |  |
| 88.6499999999971 | 1.014 | -1.014 |  |
| 88.6999999999971 | 1.013 | -1.013 |  |
| 88.7499999999971 | 1.013 | -1.013 |  |
| 88.7999999999971 | 1.012 | -1.012 |  |
| 88.8499999999971 | 1.012 | -1.012 |  |
| 88.8999999999971 | 1.011 | -1.011 |  |
| 88.94999999999708 | 1.011 | -1.011 |  |
| 88.99999999999709 | 1.01 | -1.01 |  |
| 89.04999999999708 | 1.01 | -1.01 |  |
| 89.09999999999708 | 1.009 | -1.009 |  |
| 89.14999999999706 | 1.009 | -1.009 |  |
| 89.19999999999708 | 1.008 | -1.008 |  |
| 89.24999999999707 | 1.008 | -1.008 |  |
| 89.29999999999706 | 1.007 | -1.007 |  |
| 89.34999999999707 | 1.007 | -1.007 |  |
| 89.39999999999706 | 1.006 | -1.006 |  |
| 89.44999999999706 | 1.006 | -1.006 |  |
| 89.49999999999704 | 1.005 | -1.005 |  |
| 89.54999999999706 | 1.005 | -1.005 |  |
| 89.59999999999705 | 1.004 | -1.004 |  |
| 89.64999999999704 | 1.004 | -1.004 |  |
| 89.69999999999705 | 1.003 | -1.003 |  |
| 89.74999999999704 | 1.003 | -1.003 |  |
| 89.79999999999704 | 1.002 | -1.002 |  |
| 89.84999999999702 | 1.002 | -1.002 |  |
| 89.89999999999704 | 1.001 | -1.001 |  |
| 89.949999999997 | 1.001 | -1.001 |  |
| 89.999999999997 | 1 | -1 |  |
| 90.049999999997 | 1 | -1 |  |
| 90.099999999997 | 0.999 | -0.999 |  |
| 90.149999999997 | 0.999 | -0.999 |  |
| 90.199999999997 | 0.998 | -0.998 |  |
| 90.249999999997 | 0.998 | -0.998 |  |
| 90.299999999997 | 0.997 | -0.997 |  |
| 90.349999999997 | 0.997 | -0.997 |  |
| 90.399999999997 | 0.996 | -0.996 |  |
| 90.449999999997 | 0.996 | -0.996 |  |
| 90.499999999997 | 0.995 | -0.995 |  |
| 90.549999999997 | 0.995 | -0.995 |  |
| 90.599999999997 | 0.994 | -0.994 |  |
| 90.649999999997 | 0.994 | -0.994 |  |
| 90.699999999997 | 0.993 | -0.993 |  |
| 90.74999999999697 | 0.993 | -0.993 |  |
| 90.79999999999698 | 0.992 | -0.992 |  |
| 90.84999999999698 | 0.992 | -0.992 |  |
| 90.89999999999696 | 0.991 | -0.991 |  |
| 90.94999999999698 | 0.991 | -0.991 |  |
| 90.99999999999697 | 0.99 | -0.99 |  |
| 91.04999999999697 | 0.99 | -0.99 |  |
| 91.09999999999695 | 0.989 | -0.989 |  |
| 91.14999999999696 | 0.989 | -0.989 |  |
| 91.19999999999696 | 0.988 | -0.988 |  |
| 91.24999999999694 | 0.988 | -0.988 |  |
| 91.29999999999696 | 0.987 | -0.987 |  |
| 91.34999999999695 | 0.987 | -0.987 |  |
| 91.39999999999695 | 0.986 | -0.986 |  |
| 91.44999999999693 | 0.986 | -0.986 |  |
| 91.49999999999694 | 0.985 | -0.985 |  |
| 91.54999999999694 | 0.985 | -0.985 |  |
| 91.59999999999692 | 0.984 | -0.984 |  |
| 91.64999999999694 | 0.984 | -0.984 |  |
| 91.69999999999693 | 0.983 | -0.983 |  |
| 91.74999999999693 | 0.983 | -0.983 |  |
| 91.79999999999691 | 0.982 | -0.982 |  |
| 91.84999999999692 | 0.982 | -0.982 |  |
| 91.89999999999692 | 0.981 | -0.981 |  |
| 91.9499999999969 | 0.981 | -0.981 |  |
| 91.9999999999969 | 0.98 | -0.98 |  |
| 92.0499999999969 | 0.98 | -0.98 |  |
| 92.0999999999969 | 0.979 | -0.979 |  |
| 92.1499999999969 | 0.979 | -0.979 |  |
| 92.1999999999969 | 0.978 | -0.978 |  |
| 92.2499999999969 | 0.978 | -0.978 |  |
| 92.2999999999969 | 0.978 | -0.978 |  |
| 92.3499999999969 | 0.977 | -0.977 |  |
| 92.3999999999969 | 0.977 | -0.977 |  |
| 92.4499999999969 | 0.976 | -0.976 |  |
| 92.49999999999687 | 0.976 | -0.976 |  |
| 92.54999999999688 | 0.975 | -0.975 |  |
| 92.59999999999688 | 0.975 | -0.975 |  |
| 92.64999999999687 | 0.974 | -0.974 |  |
| 92.69999999999688 | 0.974 | -0.974 |  |
| 92.74999999999687 | 0.973 | -0.973 |  |
| 92.79999999999687 | 0.973 | -0.973 |  |
| 92.84999999999685 | 0.972 | -0.972 |  |
| 92.89999999999687 | 0.972 | -0.972 |  |
| 92.94999999999686 | 0.971 | -0.971 |  |
| 92.99999999999685 | 0.971 | -0.971 |  |
| 93.04999999999686 | 0.97 | -0.97 |  |
| 93.09999999999685 | 0.97 | -0.97 |  |
| 93.14999999999685 | 0.969 | -0.969 |  |
| 93.19999999999683 | 0.969 | -0.969 |  |
| 93.24999999999685 | 0.969 | -0.969 |  |
| 93.29999999999684 | 0.968 | -0.968 |  |
| 93.34999999999683 | 0.968 | -0.968 |  |
| 93.39999999999684 | 0.967 | -0.967 |  |
| 93.44999999999683 | 0.967 | -0.967 |  |
| 93.49999999999683 | 0.966 | -0.966 |  |
| 93.54999999999681 | 0.966 | -0.966 |  |
| 93.59999999999683 | 0.965 | -0.965 |  |
| 93.64999999999682 | 0.965 | -0.965 |  |
| 93.6999999999968 | 0.964 | -0.964 |  |
| 93.7499999999968 | 0.964 | -0.964 |  |
| 93.7999999999968 | 0.963 | -0.963 |  |
| 93.8499999999968 | 0.963 | -0.963 |  |
| 93.8999999999968 | 0.962 | -0.962 |  |
| 93.9499999999968 | 0.962 | -0.962 |  |
| 93.9999999999968 | 0.962 | -0.962 |  |
| 94.0499999999968 | 0.961 | -0.961 |  |
| 94.0999999999968 | 0.961 | -0.961 |  |
| 94.1499999999968 | 0.96 | -0.96 |  |
| 94.1999999999968 | 0.96 | -0.96 |  |
| 94.24999999999677 | 0.959 | -0.959 |  |
| 94.29999999999679 | 0.959 | -0.959 |  |
| 94.34999999999678 | 0.958 | -0.958 |  |
| 94.39999999999677 | 0.958 | -0.958 |  |
| 94.44999999999678 | 0.957 | -0.957 |  |
| 94.49999999999677 | 0.957 | -0.957 |  |
| 94.54999999999677 | 0.956 | -0.956 |  |
| 94.59999999999675 | 0.956 | -0.956 |  |
| 94.64999999999677 | 0.956 | -0.956 |  |
| 94.69999999999676 | 0.955 | -0.955 |  |
| 94.74999999999675 | 0.955 | -0.955 |  |
| 94.79999999999676 | 0.954 | -0.954 |  |
| 94.84999999999675 | 0.954 | -0.954 |  |
| 94.89999999999675 | 0.953 | -0.953 |  |
| 94.94999999999673 | 0.953 | -0.953 |  |
| 94.99999999999675 | 0.952 | -0.952 |  |
| 95.04999999999674 | 0.952 | -0.952 |  |
| 95.09999999999674 | 0.951 | -0.951 |  |
| 95.14999999999672 | 0.951 | -0.951 |  |
| 95.19999999999673 | 0.951 | -0.951 |  |
| 95.24999999999673 | 0.95 | -0.95 |  |
| 95.29999999999671 | 0.95 | -0.95 |  |
| 95.34999999999673 | 0.949 | -0.949 |  |
| 95.39999999999672 | 0.949 | -0.949 |  |
| 95.4499999999967 | 0.948 | -0.948 |  |
| 95.4999999999967 | 0.948 | -0.948 |  |
| 95.5499999999967 | 0.947 | -0.947 |  |
| 95.5999999999967 | 0.947 | -0.947 |  |
| 95.6499999999967 | 0.947 | -0.947 |  |
| 95.6999999999967 | 0.946 | -0.946 |  |
| 95.7499999999967 | 0.946 | -0.946 |  |
| 95.7999999999967 | 0.945 | -0.945 |  |
| 95.8499999999967 | 0.945 | -0.945 |  |
| 95.8999999999967 | 0.944 | -0.944 |  |
| 95.9499999999967 | 0.944 | -0.944 |  |
| 95.99999999999667 | 0.943 | -0.943 |  |
| 96.04999999999669 | 0.943 | -0.943 |  |
| 96.09999999999668 | 0.943 | -0.943 |  |
| 96.14999999999668 | 0.942 | -0.942 |  |
| 96.19999999999666 | 0.942 | -0.942 |  |
| 96.24999999999667 | 0.941 | -0.941 |  |
| 96.29999999999667 | 0.941 | -0.941 |  |
| 96.34999999999665 | 0.94 | -0.94 |  |
| 96.39999999999667 | 0.94 | -0.94 |  |
| 96.44999999999666 | 0.939 | -0.939 |  |
| 96.49999999999666 | 0.939 | -0.939 |  |
| 96.54999999999664 | 0.939 | -0.939 |  |
| 96.59999999999665 | 0.938 | -0.938 |  |
| 96.64999999999665 | 0.938 | -0.938 |  |
| 96.69999999999663 | 0.937 | -0.937 |  |
| 96.74999999999665 | 0.937 | -0.937 |  |
| 96.79999999999664 | 0.936 | -0.936 |  |
| 96.84999999999664 | 0.936 | -0.936 |  |
| 96.89999999999662 | 0.935 | -0.935 |  |
| 96.94999999999663 | 0.935 | -0.935 |  |
| 96.99999999999663 | 0.935 | -0.935 |  |
| 97.04999999999661 | 0.934 | -0.934 |  |
| 97.09999999999663 | 0.934 | -0.934 |  |
| 97.14999999999662 | 0.933 | -0.933 |  |
| 97.19999999999662 | 0.933 | -0.933 |  |
| 97.2499999999966 | 0.932 | -0.932 |  |
| 97.2999999999966 | 0.932 | -0.932 |  |
| 97.3499999999966 | 0.932 | -0.932 |  |
| 97.3999999999966 | 0.931 | -0.931 |  |
| 97.4499999999966 | 0.931 | -0.931 |  |
| 97.4999999999966 | 0.93 | -0.93 |  |
| 97.5499999999966 | 0.93 | -0.93 |  |
| 97.5999999999966 | 0.929 | -0.929 |  |
| 97.6499999999966 | 0.929 | -0.929 |  |
| 97.6999999999966 | 0.929 | -0.929 |  |
| 97.74999999999658 | 0.928 | -0.928 |  |
| 97.79999999999659 | 0.928 | -0.928 |  |
| 97.84999999999658 | 0.927 | -0.927 |  |
| 97.89999999999658 | 0.927 | -0.927 |  |
| 97.94999999999656 | 0.926 | -0.926 |  |
| 97.99999999999658 | 0.926 | -0.926 |  |
| 98.04999999999657 | 0.925 | -0.925 |  |
| 98.09999999999656 | 0.925 | -0.925 |  |
| 98.14999999999657 | 0.925 | -0.925 |  |
| 98.19999999999656 | 0.924 | -0.924 |  |
| 98.24999999999656 | 0.924 | -0.924 |  |
| 98.29999999999654 | 0.923 | -0.923 |  |
| 98.34999999999656 | 0.923 | -0.923 |  |
| 98.39999999999655 | 0.923 | -0.923 |  |
| 98.44999999999654 | 0.922 | -0.922 |  |
| 98.49999999999655 | 0.922 | -0.922 |  |
| 98.54999999999654 | 0.921 | -0.921 |  |
| 98.59999999999654 | 0.921 | -0.921 |  |
| 98.64999999999652 | 0.92 | -0.92 |  |
| 98.69999999999654 | 0.92 | -0.92 |  |
| 98.74999999999653 | 0.92 | -0.92 |  |
| 98.79999999999652 | 0.919 | -0.919 |  |
| 98.84999999999653 | 0.919 | -0.919 |  |
| 98.89999999999652 | 0.918 | -0.918 |  |
| 98.9499999999965 | 0.918 | -0.918 |  |
| 98.9999999999965 | 0.917 | -0.917 |  |
| 99.0499999999965 | 0.917 | -0.917 |  |
| 99.0999999999965 | 0.917 | -0.917 |  |
| 99.1499999999965 | 0.916 | -0.916 |  |
| 99.1999999999965 | 0.916 | -0.916 |  |
| 99.2499999999965 | 0.915 | -0.915 |  |
| 99.2999999999965 | 0.915 | -0.915 |  |
| 99.3499999999965 | 0.914 | -0.914 |  |
| 99.3999999999965 | 0.914 | -0.914 |  |
| 99.4499999999965 | 0.914 | -0.914 |  |
| 99.49999999999648 | 0.913 | -0.913 |  |
| 99.54999999999649 | 0.913 | -0.913 |  |
| 99.59999999999648 | 0.912 | -0.912 |  |
| 99.64999999999648 | 0.912 | -0.912 |  |
| 99.69999999999646 | 0.912 | -0.912 |  |
| 99.74999999999648 | 0.911 | -0.911 |  |
| 99.79999999999647 | 0.911 | -0.911 |  |
| 99.84999999999646 | 0.91 | -0.91 |  |
| 99.89999999999645 | 0.91 | -0.91 |  |
| 99.94999999999646 | 0.91 | -0.91 |  |
| 99.99999999999646 | 0.909 | -0.909 |  |